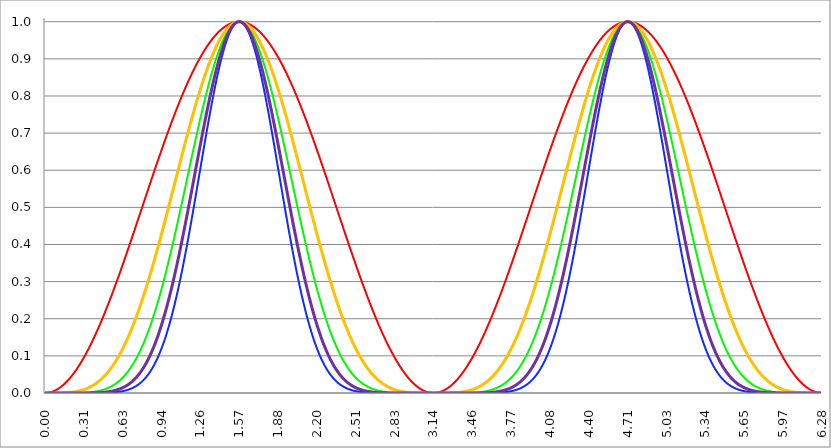
| Category | Series 1 | Series 0 | Series 2 | Series 3 | Series 4 |
|---|---|---|---|---|---|
| 0.0 | 0 | 0 | 0 | 0 | 0 |
| 0.00314159265358979 | 0 | 0 | 0 | 0 | 0 |
| 0.00628318530717958 | 0 | 0 | 0 | 0 | 0 |
| 0.00942477796076938 | 0 | 0 | 0 | 0 | 0 |
| 0.0125663706143592 | 0 | 0 | 0 | 0 | 0 |
| 0.015707963267949 | 0 | 0 | 0 | 0 | 0 |
| 0.0188495559215388 | 0 | 0 | 0 | 0 | 0 |
| 0.0219911485751285 | 0 | 0 | 0 | 0 | 0 |
| 0.0251327412287183 | 0.001 | 0 | 0 | 0 | 0 |
| 0.0282743338823081 | 0.001 | 0 | 0 | 0 | 0 |
| 0.0314159265358979 | 0.001 | 0 | 0 | 0 | 0 |
| 0.0345575191894877 | 0.001 | 0 | 0 | 0 | 0 |
| 0.0376991118430775 | 0.001 | 0 | 0 | 0 | 0 |
| 0.0408407044966673 | 0.002 | 0 | 0 | 0 | 0 |
| 0.0439822971502571 | 0.002 | 0 | 0 | 0 | 0 |
| 0.0471238898038469 | 0.002 | 0 | 0 | 0 | 0 |
| 0.0502654824574367 | 0.003 | 0 | 0 | 0 | 0 |
| 0.0534070751110265 | 0.003 | 0 | 0 | 0 | 0 |
| 0.0565486677646163 | 0.003 | 0 | 0 | 0 | 0 |
| 0.059690260418206 | 0.004 | 0 | 0 | 0 | 0 |
| 0.0628318530717958 | 0.004 | 0 | 0 | 0 | 0 |
| 0.0659734457253856 | 0.004 | 0 | 0 | 0 | 0 |
| 0.0691150383789754 | 0.005 | 0 | 0 | 0 | 0 |
| 0.0722566310325652 | 0.005 | 0 | 0 | 0 | 0 |
| 0.075398223686155 | 0.006 | 0 | 0 | 0 | 0 |
| 0.0785398163397448 | 0.006 | 0 | 0 | 0 | 0 |
| 0.0816814089933346 | 0.007 | 0 | 0 | 0 | 0 |
| 0.0848230016469244 | 0.007 | 0 | 0 | 0 | 0 |
| 0.0879645943005142 | 0.008 | 0 | 0 | 0 | 0 |
| 0.091106186954104 | 0.008 | 0 | 0 | 0 | 0 |
| 0.0942477796076937 | 0.009 | 0 | 0 | 0 | 0 |
| 0.0973893722612835 | 0.009 | 0 | 0 | 0 | 0 |
| 0.100530964914873 | 0.01 | 0 | 0 | 0 | 0 |
| 0.103672557568463 | 0.011 | 0 | 0 | 0 | 0 |
| 0.106814150222053 | 0.011 | 0 | 0 | 0 | 0 |
| 0.109955742875643 | 0.012 | 0 | 0 | 0 | 0 |
| 0.113097335529233 | 0.013 | 0 | 0 | 0 | 0 |
| 0.116238928182822 | 0.013 | 0 | 0 | 0 | 0 |
| 0.119380520836412 | 0.014 | 0 | 0 | 0 | 0 |
| 0.122522113490002 | 0.015 | 0 | 0 | 0 | 0 |
| 0.125663706143592 | 0.016 | 0 | 0 | 0 | 0 |
| 0.128805298797181 | 0.016 | 0 | 0 | 0 | 0 |
| 0.131946891450771 | 0.017 | 0 | 0 | 0 | 0 |
| 0.135088484104361 | 0.018 | 0 | 0 | 0 | 0 |
| 0.138230076757951 | 0.019 | 0 | 0 | 0 | 0 |
| 0.141371669411541 | 0.02 | 0 | 0 | 0 | 0 |
| 0.14451326206513 | 0.021 | 0 | 0 | 0 | 0 |
| 0.14765485471872 | 0.022 | 0 | 0 | 0 | 0 |
| 0.15079644737231 | 0.023 | 0 | 0 | 0.001 | 0 |
| 0.1539380400259 | 0.024 | 0 | 0 | 0.001 | 0 |
| 0.15707963267949 | 0.024 | 0 | 0 | 0.001 | 0 |
| 0.160221225333079 | 0.025 | 0 | 0 | 0.001 | 0 |
| 0.163362817986669 | 0.026 | 0 | 0 | 0.001 | 0 |
| 0.166504410640259 | 0.027 | 0 | 0 | 0.001 | 0 |
| 0.169646003293849 | 0.029 | 0 | 0 | 0.001 | 0 |
| 0.172787595947439 | 0.03 | 0 | 0 | 0.001 | 0 |
| 0.175929188601028 | 0.031 | 0 | 0 | 0.001 | 0 |
| 0.179070781254618 | 0.032 | 0 | 0 | 0.001 | 0 |
| 0.182212373908208 | 0.033 | 0 | 0 | 0.001 | 0 |
| 0.185353966561798 | 0.034 | 0 | 0 | 0.001 | 0 |
| 0.188495559215388 | 0.035 | 0 | 0 | 0.001 | 0 |
| 0.191637151868977 | 0.036 | 0 | 0 | 0.001 | 0 |
| 0.194778744522567 | 0.037 | 0 | 0 | 0.001 | 0 |
| 0.197920337176157 | 0.039 | 0 | 0 | 0.001 | 0 |
| 0.201061929829747 | 0.04 | 0 | 0 | 0.002 | 0 |
| 0.204203522483336 | 0.041 | 0 | 0 | 0.002 | 0 |
| 0.207345115136926 | 0.042 | 0 | 0 | 0.002 | 0 |
| 0.210486707790516 | 0.044 | 0 | 0 | 0.002 | 0 |
| 0.213628300444106 | 0.045 | 0 | 0 | 0.002 | 0 |
| 0.216769893097696 | 0.046 | 0 | 0 | 0.002 | 0 |
| 0.219911485751285 | 0.048 | 0 | 0 | 0.002 | 0 |
| 0.223053078404875 | 0.049 | 0 | 0 | 0.002 | 0 |
| 0.226194671058465 | 0.05 | 0 | 0 | 0.003 | 0 |
| 0.229336263712055 | 0.052 | 0 | 0 | 0.003 | 0 |
| 0.232477856365645 | 0.053 | 0 | 0 | 0.003 | 0 |
| 0.235619449019234 | 0.054 | 0 | 0 | 0.003 | 0 |
| 0.238761041672824 | 0.056 | 0 | 0 | 0.003 | 0 |
| 0.241902634326414 | 0.057 | 0 | 0 | 0.003 | 0 |
| 0.245044226980004 | 0.059 | 0 | 0 | 0.003 | 0 |
| 0.248185819633594 | 0.06 | 0 | 0 | 0.004 | 0 |
| 0.251327412287183 | 0.062 | 0 | 0 | 0.004 | 0 |
| 0.254469004940773 | 0.063 | 0 | 0 | 0.004 | 0 |
| 0.257610597594363 | 0.065 | 0 | 0 | 0.004 | 0 |
| 0.260752190247953 | 0.066 | 0 | 0 | 0.004 | 0 |
| 0.263893782901543 | 0.068 | 0 | 0 | 0.005 | 0 |
| 0.267035375555132 | 0.07 | 0 | 0 | 0.005 | 0 |
| 0.270176968208722 | 0.071 | 0 | 0 | 0.005 | 0 |
| 0.273318560862312 | 0.073 | 0 | 0 | 0.005 | 0 |
| 0.276460153515902 | 0.075 | 0 | 0 | 0.006 | 0 |
| 0.279601746169492 | 0.076 | 0 | 0 | 0.006 | 0 |
| 0.282743338823082 | 0.078 | 0 | 0 | 0.006 | 0 |
| 0.285884931476671 | 0.08 | 0.001 | 0 | 0.006 | 0 |
| 0.289026524130261 | 0.081 | 0.001 | 0 | 0.007 | 0 |
| 0.292168116783851 | 0.083 | 0.001 | 0 | 0.007 | 0 |
| 0.295309709437441 | 0.085 | 0.001 | 0 | 0.007 | 0 |
| 0.298451302091031 | 0.086 | 0.001 | 0 | 0.007 | 0 |
| 0.30159289474462 | 0.088 | 0.001 | 0 | 0.008 | 0 |
| 0.30473448739821 | 0.09 | 0.001 | 0 | 0.008 | 0 |
| 0.3078760800518 | 0.092 | 0.001 | 0 | 0.008 | 0 |
| 0.31101767270539 | 0.094 | 0.001 | 0 | 0.009 | 0 |
| 0.31415926535898 | 0.095 | 0.001 | 0 | 0.009 | 0 |
| 0.31730085801257 | 0.097 | 0.001 | 0 | 0.009 | 0 |
| 0.320442450666159 | 0.099 | 0.001 | 0 | 0.01 | 0 |
| 0.323584043319749 | 0.101 | 0.001 | 0 | 0.01 | 0 |
| 0.326725635973339 | 0.103 | 0.001 | 0 | 0.011 | 0 |
| 0.329867228626929 | 0.105 | 0.001 | 0 | 0.011 | 0 |
| 0.333008821280519 | 0.107 | 0.001 | 0 | 0.011 | 0 |
| 0.336150413934108 | 0.109 | 0.001 | 0 | 0.012 | 0 |
| 0.339292006587698 | 0.111 | 0.001 | 0 | 0.012 | 0 |
| 0.342433599241288 | 0.113 | 0.001 | 0 | 0.013 | 0 |
| 0.345575191894878 | 0.115 | 0.002 | 0 | 0.013 | 0 |
| 0.348716784548468 | 0.117 | 0.002 | 0 | 0.014 | 0 |
| 0.351858377202058 | 0.119 | 0.002 | 0 | 0.014 | 0 |
| 0.354999969855647 | 0.121 | 0.002 | 0 | 0.015 | 0 |
| 0.358141562509237 | 0.123 | 0.002 | 0 | 0.015 | 0 |
| 0.361283155162827 | 0.125 | 0.002 | 0 | 0.016 | 0 |
| 0.364424747816417 | 0.127 | 0.002 | 0 | 0.016 | 0 |
| 0.367566340470007 | 0.129 | 0.002 | 0 | 0.017 | 0 |
| 0.370707933123597 | 0.131 | 0.002 | 0 | 0.017 | 0 |
| 0.373849525777186 | 0.133 | 0.002 | 0 | 0.018 | 0 |
| 0.376991118430776 | 0.136 | 0.002 | 0 | 0.018 | 0 |
| 0.380132711084366 | 0.138 | 0.003 | 0 | 0.019 | 0 |
| 0.383274303737956 | 0.14 | 0.003 | 0 | 0.02 | 0 |
| 0.386415896391546 | 0.142 | 0.003 | 0 | 0.02 | 0 |
| 0.389557489045135 | 0.144 | 0.003 | 0 | 0.021 | 0 |
| 0.392699081698725 | 0.146 | 0.003 | 0 | 0.021 | 0 |
| 0.395840674352315 | 0.149 | 0.003 | 0 | 0.022 | 0 |
| 0.398982267005905 | 0.151 | 0.003 | 0 | 0.023 | 0.001 |
| 0.402123859659495 | 0.153 | 0.004 | 0 | 0.023 | 0.001 |
| 0.405265452313085 | 0.155 | 0.004 | 0 | 0.024 | 0.001 |
| 0.408407044966674 | 0.158 | 0.004 | 0 | 0.025 | 0.001 |
| 0.411548637620264 | 0.16 | 0.004 | 0 | 0.026 | 0.001 |
| 0.414690230273854 | 0.162 | 0.004 | 0 | 0.026 | 0.001 |
| 0.417831822927444 | 0.165 | 0.004 | 0 | 0.027 | 0.001 |
| 0.420973415581034 | 0.167 | 0.005 | 0 | 0.028 | 0.001 |
| 0.424115008234623 | 0.169 | 0.005 | 0 | 0.029 | 0.001 |
| 0.427256600888213 | 0.172 | 0.005 | 0 | 0.029 | 0.001 |
| 0.430398193541803 | 0.174 | 0.005 | 0 | 0.03 | 0.001 |
| 0.433539786195393 | 0.176 | 0.005 | 0 | 0.031 | 0.001 |
| 0.436681378848983 | 0.179 | 0.006 | 0 | 0.032 | 0.001 |
| 0.439822971502573 | 0.181 | 0.006 | 0 | 0.033 | 0.001 |
| 0.442964564156162 | 0.184 | 0.006 | 0 | 0.034 | 0.001 |
| 0.446106156809752 | 0.186 | 0.006 | 0 | 0.035 | 0.001 |
| 0.449247749463342 | 0.189 | 0.007 | 0 | 0.036 | 0.001 |
| 0.452389342116932 | 0.191 | 0.007 | 0 | 0.037 | 0.001 |
| 0.455530934770522 | 0.194 | 0.007 | 0 | 0.037 | 0.001 |
| 0.458672527424111 | 0.196 | 0.008 | 0 | 0.038 | 0.001 |
| 0.461814120077701 | 0.199 | 0.008 | 0 | 0.039 | 0.002 |
| 0.464955712731291 | 0.201 | 0.008 | 0 | 0.04 | 0.002 |
| 0.468097305384881 | 0.204 | 0.008 | 0 | 0.041 | 0.002 |
| 0.471238898038471 | 0.206 | 0.009 | 0 | 0.042 | 0.002 |
| 0.474380490692061 | 0.209 | 0.009 | 0 | 0.044 | 0.002 |
| 0.47752208334565 | 0.211 | 0.009 | 0 | 0.045 | 0.002 |
| 0.48066367599924 | 0.214 | 0.01 | 0 | 0.046 | 0.002 |
| 0.48380526865283 | 0.216 | 0.01 | 0 | 0.047 | 0.002 |
| 0.48694686130642 | 0.219 | 0.01 | 0.001 | 0.048 | 0.002 |
| 0.49008845396001 | 0.222 | 0.011 | 0.001 | 0.049 | 0.002 |
| 0.493230046613599 | 0.224 | 0.011 | 0.001 | 0.05 | 0.003 |
| 0.496371639267189 | 0.227 | 0.012 | 0.001 | 0.051 | 0.003 |
| 0.499513231920779 | 0.229 | 0.012 | 0.001 | 0.053 | 0.003 |
| 0.502654824574369 | 0.232 | 0.013 | 0.001 | 0.054 | 0.003 |
| 0.505796417227959 | 0.235 | 0.013 | 0.001 | 0.055 | 0.003 |
| 0.508938009881549 | 0.237 | 0.013 | 0.001 | 0.056 | 0.003 |
| 0.512079602535138 | 0.24 | 0.014 | 0.001 | 0.058 | 0.003 |
| 0.515221195188728 | 0.243 | 0.014 | 0.001 | 0.059 | 0.003 |
| 0.518362787842318 | 0.245 | 0.015 | 0.001 | 0.06 | 0.004 |
| 0.521504380495908 | 0.248 | 0.015 | 0.001 | 0.062 | 0.004 |
| 0.524645973149498 | 0.251 | 0.016 | 0.001 | 0.063 | 0.004 |
| 0.527787565803087 | 0.254 | 0.016 | 0.001 | 0.064 | 0.004 |
| 0.530929158456677 | 0.256 | 0.017 | 0.001 | 0.066 | 0.004 |
| 0.534070751110267 | 0.259 | 0.017 | 0.001 | 0.067 | 0.005 |
| 0.537212343763857 | 0.262 | 0.018 | 0.001 | 0.069 | 0.005 |
| 0.540353936417447 | 0.265 | 0.019 | 0.001 | 0.07 | 0.005 |
| 0.543495529071037 | 0.267 | 0.019 | 0.001 | 0.072 | 0.005 |
| 0.546637121724626 | 0.27 | 0.02 | 0.001 | 0.073 | 0.005 |
| 0.549778714378216 | 0.273 | 0.02 | 0.002 | 0.075 | 0.006 |
| 0.552920307031806 | 0.276 | 0.021 | 0.002 | 0.076 | 0.006 |
| 0.556061899685396 | 0.279 | 0.022 | 0.002 | 0.078 | 0.006 |
| 0.559203492338986 | 0.281 | 0.022 | 0.002 | 0.079 | 0.006 |
| 0.562345084992576 | 0.284 | 0.023 | 0.002 | 0.081 | 0.007 |
| 0.565486677646165 | 0.287 | 0.024 | 0.002 | 0.082 | 0.007 |
| 0.568628270299755 | 0.29 | 0.024 | 0.002 | 0.084 | 0.007 |
| 0.571769862953345 | 0.293 | 0.025 | 0.002 | 0.086 | 0.007 |
| 0.574911455606935 | 0.296 | 0.026 | 0.002 | 0.087 | 0.008 |
| 0.578053048260525 | 0.299 | 0.027 | 0.002 | 0.089 | 0.008 |
| 0.581194640914114 | 0.301 | 0.027 | 0.002 | 0.091 | 0.008 |
| 0.584336233567704 | 0.304 | 0.028 | 0.003 | 0.093 | 0.009 |
| 0.587477826221294 | 0.307 | 0.029 | 0.003 | 0.094 | 0.009 |
| 0.590619418874884 | 0.31 | 0.03 | 0.003 | 0.096 | 0.009 |
| 0.593761011528474 | 0.313 | 0.031 | 0.003 | 0.098 | 0.01 |
| 0.596902604182064 | 0.316 | 0.032 | 0.003 | 0.1 | 0.01 |
| 0.600044196835653 | 0.319 | 0.032 | 0.003 | 0.102 | 0.01 |
| 0.603185789489243 | 0.322 | 0.033 | 0.003 | 0.104 | 0.011 |
| 0.606327382142833 | 0.325 | 0.034 | 0.004 | 0.105 | 0.011 |
| 0.609468974796423 | 0.328 | 0.035 | 0.004 | 0.107 | 0.012 |
| 0.612610567450013 | 0.331 | 0.036 | 0.004 | 0.109 | 0.012 |
| 0.615752160103602 | 0.334 | 0.037 | 0.004 | 0.111 | 0.012 |
| 0.618893752757192 | 0.337 | 0.038 | 0.004 | 0.113 | 0.013 |
| 0.622035345410782 | 0.34 | 0.039 | 0.005 | 0.115 | 0.013 |
| 0.625176938064372 | 0.343 | 0.04 | 0.005 | 0.117 | 0.014 |
| 0.628318530717962 | 0.345 | 0.041 | 0.005 | 0.119 | 0.014 |
| 0.631460123371551 | 0.348 | 0.042 | 0.005 | 0.121 | 0.015 |
| 0.634601716025141 | 0.351 | 0.043 | 0.005 | 0.124 | 0.015 |
| 0.637743308678731 | 0.354 | 0.045 | 0.006 | 0.126 | 0.016 |
| 0.640884901332321 | 0.357 | 0.046 | 0.006 | 0.128 | 0.016 |
| 0.644026493985911 | 0.361 | 0.047 | 0.006 | 0.13 | 0.017 |
| 0.647168086639501 | 0.364 | 0.048 | 0.006 | 0.132 | 0.017 |
| 0.65030967929309 | 0.367 | 0.049 | 0.007 | 0.134 | 0.018 |
| 0.65345127194668 | 0.37 | 0.05 | 0.007 | 0.137 | 0.019 |
| 0.65659286460027 | 0.373 | 0.052 | 0.007 | 0.139 | 0.019 |
| 0.65973445725386 | 0.376 | 0.053 | 0.007 | 0.141 | 0.02 |
| 0.66287604990745 | 0.379 | 0.054 | 0.008 | 0.143 | 0.021 |
| 0.666017642561039 | 0.382 | 0.056 | 0.008 | 0.146 | 0.021 |
| 0.669159235214629 | 0.385 | 0.057 | 0.008 | 0.148 | 0.022 |
| 0.672300827868219 | 0.388 | 0.058 | 0.009 | 0.15 | 0.023 |
| 0.675442420521809 | 0.391 | 0.06 | 0.009 | 0.153 | 0.023 |
| 0.678584013175399 | 0.394 | 0.061 | 0.009 | 0.155 | 0.024 |
| 0.681725605828989 | 0.397 | 0.063 | 0.01 | 0.158 | 0.025 |
| 0.684867198482578 | 0.4 | 0.064 | 0.01 | 0.16 | 0.026 |
| 0.688008791136168 | 0.403 | 0.066 | 0.011 | 0.163 | 0.026 |
| 0.691150383789758 | 0.406 | 0.067 | 0.011 | 0.165 | 0.027 |
| 0.694291976443348 | 0.409 | 0.069 | 0.012 | 0.168 | 0.028 |
| 0.697433569096938 | 0.412 | 0.07 | 0.012 | 0.17 | 0.029 |
| 0.700575161750528 | 0.416 | 0.072 | 0.012 | 0.173 | 0.03 |
| 0.703716754404117 | 0.419 | 0.073 | 0.013 | 0.175 | 0.031 |
| 0.706858347057707 | 0.422 | 0.075 | 0.013 | 0.178 | 0.032 |
| 0.709999939711297 | 0.425 | 0.077 | 0.014 | 0.181 | 0.033 |
| 0.713141532364887 | 0.428 | 0.078 | 0.014 | 0.183 | 0.034 |
| 0.716283125018477 | 0.431 | 0.08 | 0.015 | 0.186 | 0.035 |
| 0.719424717672066 | 0.434 | 0.082 | 0.015 | 0.189 | 0.036 |
| 0.722566310325656 | 0.437 | 0.084 | 0.016 | 0.191 | 0.037 |
| 0.725707902979246 | 0.44 | 0.085 | 0.017 | 0.194 | 0.038 |
| 0.728849495632836 | 0.444 | 0.087 | 0.017 | 0.197 | 0.039 |
| 0.731991088286426 | 0.447 | 0.089 | 0.018 | 0.2 | 0.04 |
| 0.735132680940016 | 0.45 | 0.091 | 0.018 | 0.202 | 0.041 |
| 0.738274273593605 | 0.453 | 0.093 | 0.019 | 0.205 | 0.042 |
| 0.741415866247195 | 0.456 | 0.095 | 0.02 | 0.208 | 0.043 |
| 0.744557458900785 | 0.459 | 0.097 | 0.02 | 0.211 | 0.044 |
| 0.747699051554375 | 0.462 | 0.099 | 0.021 | 0.214 | 0.046 |
| 0.750840644207965 | 0.465 | 0.101 | 0.022 | 0.217 | 0.047 |
| 0.753982236861554 | 0.469 | 0.103 | 0.023 | 0.22 | 0.048 |
| 0.757123829515144 | 0.472 | 0.105 | 0.023 | 0.223 | 0.05 |
| 0.760265422168734 | 0.475 | 0.107 | 0.024 | 0.226 | 0.051 |
| 0.763407014822324 | 0.478 | 0.109 | 0.025 | 0.228 | 0.052 |
| 0.766548607475914 | 0.481 | 0.111 | 0.026 | 0.232 | 0.054 |
| 0.769690200129504 | 0.484 | 0.114 | 0.027 | 0.235 | 0.055 |
| 0.772831792783093 | 0.487 | 0.116 | 0.028 | 0.238 | 0.056 |
| 0.775973385436683 | 0.491 | 0.118 | 0.028 | 0.241 | 0.058 |
| 0.779114978090273 | 0.494 | 0.12 | 0.029 | 0.244 | 0.059 |
| 0.782256570743863 | 0.497 | 0.123 | 0.03 | 0.247 | 0.061 |
| 0.785398163397453 | 0.5 | 0.125 | 0.031 | 0.25 | 0.063 |
| 0.788539756051042 | 0.503 | 0.127 | 0.032 | 0.253 | 0.064 |
| 0.791681348704632 | 0.506 | 0.13 | 0.033 | 0.256 | 0.066 |
| 0.794822941358222 | 0.509 | 0.132 | 0.034 | 0.26 | 0.067 |
| 0.797964534011812 | 0.513 | 0.135 | 0.035 | 0.263 | 0.069 |
| 0.801106126665402 | 0.516 | 0.137 | 0.036 | 0.266 | 0.071 |
| 0.804247719318992 | 0.519 | 0.14 | 0.038 | 0.269 | 0.072 |
| 0.807389311972581 | 0.522 | 0.142 | 0.039 | 0.272 | 0.074 |
| 0.810530904626171 | 0.525 | 0.145 | 0.04 | 0.276 | 0.076 |
| 0.813672497279761 | 0.528 | 0.147 | 0.041 | 0.279 | 0.078 |
| 0.816814089933351 | 0.531 | 0.15 | 0.042 | 0.282 | 0.08 |
| 0.819955682586941 | 0.535 | 0.153 | 0.044 | 0.286 | 0.082 |
| 0.823097275240531 | 0.538 | 0.155 | 0.045 | 0.289 | 0.084 |
| 0.82623886789412 | 0.541 | 0.158 | 0.046 | 0.292 | 0.086 |
| 0.82938046054771 | 0.544 | 0.161 | 0.048 | 0.296 | 0.088 |
| 0.8325220532013 | 0.547 | 0.164 | 0.049 | 0.299 | 0.09 |
| 0.83566364585489 | 0.55 | 0.167 | 0.05 | 0.303 | 0.092 |
| 0.83880523850848 | 0.553 | 0.169 | 0.052 | 0.306 | 0.094 |
| 0.841946831162069 | 0.556 | 0.172 | 0.053 | 0.31 | 0.096 |
| 0.845088423815659 | 0.56 | 0.175 | 0.055 | 0.313 | 0.098 |
| 0.848230016469249 | 0.563 | 0.178 | 0.056 | 0.317 | 0.1 |
| 0.851371609122839 | 0.566 | 0.181 | 0.058 | 0.32 | 0.102 |
| 0.854513201776429 | 0.569 | 0.184 | 0.06 | 0.324 | 0.105 |
| 0.857654794430019 | 0.572 | 0.187 | 0.061 | 0.327 | 0.107 |
| 0.860796387083608 | 0.575 | 0.19 | 0.063 | 0.331 | 0.109 |
| 0.863937979737198 | 0.578 | 0.193 | 0.065 | 0.334 | 0.112 |
| 0.867079572390788 | 0.581 | 0.196 | 0.066 | 0.338 | 0.114 |
| 0.870221165044378 | 0.584 | 0.2 | 0.068 | 0.342 | 0.117 |
| 0.873362757697968 | 0.588 | 0.203 | 0.07 | 0.345 | 0.119 |
| 0.876504350351557 | 0.591 | 0.206 | 0.072 | 0.349 | 0.122 |
| 0.879645943005147 | 0.594 | 0.209 | 0.074 | 0.352 | 0.124 |
| 0.882787535658737 | 0.597 | 0.213 | 0.076 | 0.356 | 0.127 |
| 0.885929128312327 | 0.6 | 0.216 | 0.078 | 0.36 | 0.129 |
| 0.889070720965917 | 0.603 | 0.219 | 0.08 | 0.364 | 0.132 |
| 0.892212313619507 | 0.606 | 0.223 | 0.082 | 0.367 | 0.135 |
| 0.895353906273096 | 0.609 | 0.226 | 0.084 | 0.371 | 0.138 |
| 0.898495498926686 | 0.612 | 0.229 | 0.086 | 0.375 | 0.14 |
| 0.901637091580276 | 0.615 | 0.233 | 0.088 | 0.378 | 0.143 |
| 0.904778684233866 | 0.618 | 0.236 | 0.09 | 0.382 | 0.146 |
| 0.907920276887456 | 0.621 | 0.24 | 0.093 | 0.386 | 0.149 |
| 0.911061869541045 | 0.624 | 0.243 | 0.095 | 0.39 | 0.152 |
| 0.914203462194635 | 0.627 | 0.247 | 0.097 | 0.394 | 0.155 |
| 0.917345054848225 | 0.63 | 0.251 | 0.1 | 0.397 | 0.158 |
| 0.920486647501815 | 0.633 | 0.254 | 0.102 | 0.401 | 0.161 |
| 0.923628240155405 | 0.636 | 0.258 | 0.104 | 0.405 | 0.164 |
| 0.926769832808995 | 0.639 | 0.262 | 0.107 | 0.409 | 0.167 |
| 0.929911425462584 | 0.643 | 0.265 | 0.109 | 0.413 | 0.17 |
| 0.933053018116174 | 0.646 | 0.269 | 0.112 | 0.417 | 0.174 |
| 0.936194610769764 | 0.649 | 0.273 | 0.115 | 0.421 | 0.177 |
| 0.939336203423354 | 0.652 | 0.277 | 0.117 | 0.424 | 0.18 |
| 0.942477796076944 | 0.655 | 0.28 | 0.12 | 0.428 | 0.184 |
| 0.945619388730533 | 0.657 | 0.284 | 0.123 | 0.432 | 0.187 |
| 0.948760981384123 | 0.66 | 0.288 | 0.126 | 0.436 | 0.19 |
| 0.951902574037713 | 0.663 | 0.292 | 0.129 | 0.44 | 0.194 |
| 0.955044166691303 | 0.666 | 0.296 | 0.131 | 0.444 | 0.197 |
| 0.958185759344893 | 0.669 | 0.3 | 0.134 | 0.448 | 0.201 |
| 0.961327351998483 | 0.672 | 0.304 | 0.137 | 0.452 | 0.204 |
| 0.964468944652072 | 0.675 | 0.308 | 0.14 | 0.456 | 0.208 |
| 0.967610537305662 | 0.678 | 0.312 | 0.143 | 0.46 | 0.212 |
| 0.970752129959252 | 0.681 | 0.316 | 0.147 | 0.464 | 0.215 |
| 0.973893722612842 | 0.684 | 0.32 | 0.15 | 0.468 | 0.219 |
| 0.977035315266432 | 0.687 | 0.324 | 0.153 | 0.472 | 0.223 |
| 0.980176907920022 | 0.69 | 0.328 | 0.156 | 0.476 | 0.227 |
| 0.983318500573611 | 0.693 | 0.333 | 0.16 | 0.48 | 0.23 |
| 0.986460093227201 | 0.696 | 0.337 | 0.163 | 0.484 | 0.234 |
| 0.989601685880791 | 0.699 | 0.341 | 0.166 | 0.488 | 0.238 |
| 0.992743278534381 | 0.701 | 0.345 | 0.17 | 0.492 | 0.242 |
| 0.995884871187971 | 0.704 | 0.349 | 0.173 | 0.496 | 0.246 |
| 0.99902646384156 | 0.707 | 0.354 | 0.177 | 0.5 | 0.25 |
| 1.00216805649515 | 0.71 | 0.358 | 0.18 | 0.504 | 0.254 |
| 1.00530964914874 | 0.713 | 0.362 | 0.184 | 0.508 | 0.258 |
| 1.00845124180233 | 0.716 | 0.367 | 0.188 | 0.512 | 0.262 |
| 1.01159283445592 | 0.719 | 0.371 | 0.192 | 0.516 | 0.267 |
| 1.01473442710951 | 0.721 | 0.375 | 0.195 | 0.52 | 0.271 |
| 1.017876019763099 | 0.724 | 0.38 | 0.199 | 0.524 | 0.275 |
| 1.021017612416689 | 0.727 | 0.384 | 0.203 | 0.529 | 0.279 |
| 1.02415920507028 | 0.73 | 0.389 | 0.207 | 0.533 | 0.284 |
| 1.027300797723869 | 0.733 | 0.393 | 0.211 | 0.537 | 0.288 |
| 1.030442390377459 | 0.735 | 0.398 | 0.215 | 0.541 | 0.292 |
| 1.033583983031048 | 0.738 | 0.402 | 0.219 | 0.545 | 0.297 |
| 1.036725575684638 | 0.741 | 0.407 | 0.223 | 0.549 | 0.301 |
| 1.039867168338228 | 0.744 | 0.411 | 0.227 | 0.553 | 0.306 |
| 1.043008760991818 | 0.746 | 0.416 | 0.232 | 0.557 | 0.31 |
| 1.046150353645408 | 0.749 | 0.42 | 0.236 | 0.561 | 0.315 |
| 1.049291946298998 | 0.752 | 0.425 | 0.24 | 0.565 | 0.319 |
| 1.052433538952587 | 0.755 | 0.43 | 0.245 | 0.569 | 0.324 |
| 1.055575131606177 | 0.757 | 0.434 | 0.249 | 0.573 | 0.329 |
| 1.058716724259767 | 0.76 | 0.439 | 0.253 | 0.577 | 0.333 |
| 1.061858316913357 | 0.763 | 0.443 | 0.258 | 0.582 | 0.338 |
| 1.064999909566947 | 0.765 | 0.448 | 0.262 | 0.586 | 0.343 |
| 1.068141502220536 | 0.768 | 0.453 | 0.267 | 0.59 | 0.348 |
| 1.071283094874126 | 0.771 | 0.458 | 0.272 | 0.594 | 0.353 |
| 1.074424687527716 | 0.773 | 0.462 | 0.276 | 0.598 | 0.357 |
| 1.077566280181306 | 0.776 | 0.467 | 0.281 | 0.602 | 0.362 |
| 1.080707872834896 | 0.778 | 0.472 | 0.286 | 0.606 | 0.367 |
| 1.083849465488486 | 0.781 | 0.476 | 0.291 | 0.61 | 0.372 |
| 1.086991058142075 | 0.784 | 0.481 | 0.296 | 0.614 | 0.377 |
| 1.090132650795665 | 0.786 | 0.486 | 0.3 | 0.618 | 0.382 |
| 1.093274243449255 | 0.789 | 0.491 | 0.305 | 0.622 | 0.387 |
| 1.096415836102845 | 0.791 | 0.496 | 0.31 | 0.626 | 0.392 |
| 1.099557428756435 | 0.794 | 0.5 | 0.315 | 0.63 | 0.397 |
| 1.102699021410025 | 0.796 | 0.505 | 0.32 | 0.634 | 0.402 |
| 1.105840614063614 | 0.799 | 0.51 | 0.326 | 0.638 | 0.407 |
| 1.108982206717204 | 0.801 | 0.515 | 0.331 | 0.642 | 0.413 |
| 1.112123799370794 | 0.804 | 0.52 | 0.336 | 0.646 | 0.418 |
| 1.115265392024384 | 0.806 | 0.524 | 0.341 | 0.65 | 0.423 |
| 1.118406984677974 | 0.809 | 0.529 | 0.346 | 0.654 | 0.428 |
| 1.121548577331563 | 0.811 | 0.534 | 0.352 | 0.658 | 0.433 |
| 1.124690169985153 | 0.814 | 0.539 | 0.357 | 0.662 | 0.439 |
| 1.127831762638743 | 0.816 | 0.544 | 0.362 | 0.666 | 0.444 |
| 1.130973355292333 | 0.819 | 0.549 | 0.368 | 0.67 | 0.449 |
| 1.134114947945923 | 0.821 | 0.554 | 0.373 | 0.674 | 0.455 |
| 1.137256540599513 | 0.824 | 0.559 | 0.379 | 0.678 | 0.46 |
| 1.140398133253102 | 0.826 | 0.563 | 0.384 | 0.682 | 0.465 |
| 1.143539725906692 | 0.828 | 0.568 | 0.39 | 0.686 | 0.471 |
| 1.146681318560282 | 0.831 | 0.573 | 0.395 | 0.69 | 0.476 |
| 1.149822911213872 | 0.833 | 0.578 | 0.401 | 0.694 | 0.481 |
| 1.152964503867462 | 0.835 | 0.583 | 0.407 | 0.698 | 0.487 |
| 1.156106096521051 | 0.838 | 0.588 | 0.412 | 0.702 | 0.492 |
| 1.159247689174641 | 0.84 | 0.593 | 0.418 | 0.706 | 0.498 |
| 1.162389281828231 | 0.842 | 0.598 | 0.424 | 0.709 | 0.503 |
| 1.165530874481821 | 0.845 | 0.602 | 0.43 | 0.713 | 0.509 |
| 1.168672467135411 | 0.847 | 0.607 | 0.435 | 0.717 | 0.514 |
| 1.171814059789001 | 0.849 | 0.612 | 0.441 | 0.721 | 0.52 |
| 1.17495565244259 | 0.851 | 0.617 | 0.447 | 0.725 | 0.525 |
| 1.17809724509618 | 0.854 | 0.622 | 0.453 | 0.729 | 0.531 |
| 1.18123883774977 | 0.856 | 0.627 | 0.459 | 0.732 | 0.536 |
| 1.18438043040336 | 0.858 | 0.632 | 0.465 | 0.736 | 0.542 |
| 1.18752202305695 | 0.86 | 0.636 | 0.471 | 0.74 | 0.547 |
| 1.190663615710539 | 0.862 | 0.641 | 0.477 | 0.744 | 0.553 |
| 1.193805208364129 | 0.864 | 0.646 | 0.483 | 0.747 | 0.559 |
| 1.19694680101772 | 0.867 | 0.651 | 0.489 | 0.751 | 0.564 |
| 1.200088393671309 | 0.869 | 0.656 | 0.495 | 0.755 | 0.57 |
| 1.203229986324899 | 0.871 | 0.66 | 0.501 | 0.758 | 0.575 |
| 1.206371578978489 | 0.873 | 0.665 | 0.507 | 0.762 | 0.581 |
| 1.209513171632078 | 0.875 | 0.67 | 0.513 | 0.766 | 0.586 |
| 1.212654764285668 | 0.877 | 0.675 | 0.519 | 0.769 | 0.592 |
| 1.215796356939258 | 0.879 | 0.68 | 0.525 | 0.773 | 0.597 |
| 1.218937949592848 | 0.881 | 0.684 | 0.531 | 0.777 | 0.603 |
| 1.222079542246438 | 0.883 | 0.689 | 0.538 | 0.78 | 0.609 |
| 1.225221134900027 | 0.885 | 0.694 | 0.544 | 0.784 | 0.614 |
| 1.228362727553617 | 0.887 | 0.698 | 0.55 | 0.787 | 0.62 |
| 1.231504320207207 | 0.889 | 0.703 | 0.556 | 0.791 | 0.625 |
| 1.234645912860797 | 0.891 | 0.708 | 0.562 | 0.794 | 0.631 |
| 1.237787505514387 | 0.893 | 0.712 | 0.568 | 0.798 | 0.636 |
| 1.240929098167977 | 0.895 | 0.717 | 0.575 | 0.801 | 0.642 |
| 1.244070690821566 | 0.897 | 0.722 | 0.581 | 0.805 | 0.647 |
| 1.247212283475156 | 0.899 | 0.726 | 0.587 | 0.808 | 0.653 |
| 1.250353876128746 | 0.901 | 0.731 | 0.593 | 0.811 | 0.658 |
| 1.253495468782336 | 0.903 | 0.735 | 0.599 | 0.815 | 0.664 |
| 1.256637061435926 | 0.905 | 0.74 | 0.605 | 0.818 | 0.669 |
| 1.259778654089515 | 0.906 | 0.745 | 0.612 | 0.821 | 0.675 |
| 1.262920246743105 | 0.908 | 0.749 | 0.618 | 0.825 | 0.68 |
| 1.266061839396695 | 0.91 | 0.754 | 0.624 | 0.828 | 0.686 |
| 1.269203432050285 | 0.912 | 0.758 | 0.63 | 0.831 | 0.691 |
| 1.272345024703875 | 0.914 | 0.762 | 0.636 | 0.835 | 0.696 |
| 1.275486617357465 | 0.915 | 0.767 | 0.642 | 0.838 | 0.702 |
| 1.278628210011054 | 0.917 | 0.771 | 0.649 | 0.841 | 0.707 |
| 1.281769802664644 | 0.919 | 0.776 | 0.655 | 0.844 | 0.713 |
| 1.284911395318234 | 0.92 | 0.78 | 0.661 | 0.847 | 0.718 |
| 1.288052987971824 | 0.922 | 0.784 | 0.667 | 0.85 | 0.723 |
| 1.291194580625414 | 0.924 | 0.788 | 0.673 | 0.853 | 0.728 |
| 1.294336173279003 | 0.925 | 0.793 | 0.679 | 0.857 | 0.734 |
| 1.297477765932593 | 0.927 | 0.797 | 0.685 | 0.86 | 0.739 |
| 1.300619358586183 | 0.929 | 0.801 | 0.691 | 0.863 | 0.744 |
| 1.303760951239773 | 0.93 | 0.805 | 0.697 | 0.866 | 0.749 |
| 1.306902543893363 | 0.932 | 0.809 | 0.703 | 0.869 | 0.754 |
| 1.310044136546953 | 0.934 | 0.814 | 0.709 | 0.871 | 0.759 |
| 1.313185729200542 | 0.935 | 0.818 | 0.715 | 0.874 | 0.765 |
| 1.316327321854132 | 0.937 | 0.822 | 0.721 | 0.877 | 0.77 |
| 1.319468914507722 | 0.938 | 0.826 | 0.727 | 0.88 | 0.775 |
| 1.322610507161312 | 0.94 | 0.83 | 0.733 | 0.883 | 0.78 |
| 1.325752099814902 | 0.941 | 0.834 | 0.738 | 0.886 | 0.785 |
| 1.328893692468491 | 0.943 | 0.838 | 0.744 | 0.889 | 0.789 |
| 1.332035285122081 | 0.944 | 0.841 | 0.75 | 0.891 | 0.794 |
| 1.335176877775671 | 0.946 | 0.845 | 0.756 | 0.894 | 0.799 |
| 1.338318470429261 | 0.947 | 0.849 | 0.761 | 0.897 | 0.804 |
| 1.341460063082851 | 0.948 | 0.853 | 0.767 | 0.899 | 0.809 |
| 1.344601655736441 | 0.95 | 0.857 | 0.773 | 0.902 | 0.813 |
| 1.34774324839003 | 0.951 | 0.86 | 0.778 | 0.905 | 0.818 |
| 1.35088484104362 | 0.952 | 0.864 | 0.784 | 0.907 | 0.823 |
| 1.35402643369721 | 0.954 | 0.868 | 0.789 | 0.91 | 0.827 |
| 1.3571680263508 | 0.955 | 0.871 | 0.795 | 0.912 | 0.832 |
| 1.36030961900439 | 0.956 | 0.875 | 0.8 | 0.915 | 0.836 |
| 1.363451211657979 | 0.958 | 0.878 | 0.805 | 0.917 | 0.841 |
| 1.36659280431157 | 0.959 | 0.882 | 0.811 | 0.919 | 0.845 |
| 1.369734396965159 | 0.96 | 0.885 | 0.816 | 0.922 | 0.85 |
| 1.372875989618749 | 0.961 | 0.888 | 0.821 | 0.924 | 0.854 |
| 1.376017582272339 | 0.963 | 0.892 | 0.826 | 0.926 | 0.858 |
| 1.379159174925929 | 0.964 | 0.895 | 0.831 | 0.929 | 0.863 |
| 1.382300767579518 | 0.965 | 0.898 | 0.836 | 0.931 | 0.867 |
| 1.385442360233108 | 0.966 | 0.902 | 0.841 | 0.933 | 0.871 |
| 1.388583952886698 | 0.967 | 0.905 | 0.846 | 0.935 | 0.875 |
| 1.391725545540288 | 0.968 | 0.908 | 0.851 | 0.938 | 0.879 |
| 1.394867138193878 | 0.969 | 0.911 | 0.856 | 0.94 | 0.883 |
| 1.398008730847468 | 0.97 | 0.914 | 0.861 | 0.942 | 0.887 |
| 1.401150323501057 | 0.971 | 0.917 | 0.865 | 0.944 | 0.891 |
| 1.404291916154647 | 0.973 | 0.92 | 0.87 | 0.946 | 0.895 |
| 1.407433508808237 | 0.974 | 0.923 | 0.875 | 0.948 | 0.898 |
| 1.410575101461827 | 0.975 | 0.926 | 0.879 | 0.95 | 0.902 |
| 1.413716694115417 | 0.976 | 0.928 | 0.883 | 0.952 | 0.906 |
| 1.416858286769006 | 0.976 | 0.931 | 0.888 | 0.954 | 0.909 |
| 1.419999879422596 | 0.977 | 0.934 | 0.892 | 0.955 | 0.913 |
| 1.423141472076186 | 0.978 | 0.936 | 0.896 | 0.957 | 0.916 |
| 1.426283064729776 | 0.979 | 0.939 | 0.901 | 0.959 | 0.92 |
| 1.429424657383366 | 0.98 | 0.942 | 0.905 | 0.961 | 0.923 |
| 1.432566250036956 | 0.981 | 0.944 | 0.909 | 0.962 | 0.926 |
| 1.435707842690545 | 0.982 | 0.947 | 0.913 | 0.964 | 0.929 |
| 1.438849435344135 | 0.983 | 0.949 | 0.916 | 0.966 | 0.933 |
| 1.441991027997725 | 0.984 | 0.951 | 0.92 | 0.967 | 0.936 |
| 1.445132620651315 | 0.984 | 0.954 | 0.924 | 0.969 | 0.939 |
| 1.448274213304905 | 0.985 | 0.956 | 0.928 | 0.97 | 0.942 |
| 1.451415805958494 | 0.986 | 0.958 | 0.931 | 0.972 | 0.944 |
| 1.454557398612084 | 0.987 | 0.96 | 0.935 | 0.973 | 0.947 |
| 1.457698991265674 | 0.987 | 0.962 | 0.938 | 0.975 | 0.95 |
| 1.460840583919264 | 0.988 | 0.964 | 0.941 | 0.976 | 0.953 |
| 1.463982176572854 | 0.989 | 0.966 | 0.944 | 0.977 | 0.955 |
| 1.467123769226444 | 0.989 | 0.968 | 0.948 | 0.979 | 0.958 |
| 1.470265361880033 | 0.99 | 0.97 | 0.951 | 0.98 | 0.96 |
| 1.473406954533623 | 0.991 | 0.972 | 0.954 | 0.981 | 0.963 |
| 1.476548547187213 | 0.991 | 0.974 | 0.956 | 0.982 | 0.965 |
| 1.479690139840803 | 0.992 | 0.975 | 0.959 | 0.984 | 0.967 |
| 1.482831732494393 | 0.992 | 0.977 | 0.962 | 0.985 | 0.969 |
| 1.485973325147982 | 0.993 | 0.979 | 0.965 | 0.986 | 0.972 |
| 1.489114917801572 | 0.993 | 0.98 | 0.967 | 0.987 | 0.974 |
| 1.492256510455162 | 0.994 | 0.982 | 0.97 | 0.988 | 0.976 |
| 1.495398103108752 | 0.994 | 0.983 | 0.972 | 0.989 | 0.977 |
| 1.498539695762342 | 0.995 | 0.984 | 0.974 | 0.99 | 0.979 |
| 1.501681288415932 | 0.995 | 0.986 | 0.976 | 0.99 | 0.981 |
| 1.504822881069521 | 0.996 | 0.987 | 0.978 | 0.991 | 0.983 |
| 1.507964473723111 | 0.996 | 0.988 | 0.98 | 0.992 | 0.984 |
| 1.511106066376701 | 0.996 | 0.989 | 0.982 | 0.993 | 0.986 |
| 1.514247659030291 | 0.997 | 0.99 | 0.984 | 0.994 | 0.987 |
| 1.517389251683881 | 0.997 | 0.991 | 0.986 | 0.994 | 0.989 |
| 1.520530844337471 | 0.997 | 0.992 | 0.987 | 0.995 | 0.99 |
| 1.52367243699106 | 0.998 | 0.993 | 0.989 | 0.996 | 0.991 |
| 1.52681402964465 | 0.998 | 0.994 | 0.99 | 0.996 | 0.992 |
| 1.52995562229824 | 0.998 | 0.995 | 0.992 | 0.997 | 0.993 |
| 1.53309721495183 | 0.999 | 0.996 | 0.993 | 0.997 | 0.994 |
| 1.53623880760542 | 0.999 | 0.996 | 0.994 | 0.998 | 0.995 |
| 1.539380400259009 | 0.999 | 0.997 | 0.995 | 0.998 | 0.996 |
| 1.542521992912599 | 0.999 | 0.998 | 0.996 | 0.998 | 0.997 |
| 1.545663585566189 | 0.999 | 0.998 | 0.997 | 0.999 | 0.997 |
| 1.548805178219779 | 1 | 0.999 | 0.998 | 0.999 | 0.998 |
| 1.551946770873369 | 1 | 0.999 | 0.998 | 0.999 | 0.999 |
| 1.555088363526959 | 1 | 0.999 | 0.999 | 1 | 0.999 |
| 1.558229956180548 | 1 | 1 | 0.999 | 1 | 0.999 |
| 1.561371548834138 | 1 | 1 | 1 | 1 | 1 |
| 1.564513141487728 | 1 | 1 | 1 | 1 | 1 |
| 1.567654734141318 | 1 | 1 | 1 | 1 | 1 |
| 1.570796326794908 | 1 | 1 | 1 | 1 | 1 |
| 1.573937919448497 | 1 | 1 | 1 | 1 | 1 |
| 1.577079512102087 | 1 | 1 | 1 | 1 | 1 |
| 1.580221104755677 | 1 | 1 | 1 | 1 | 1 |
| 1.583362697409267 | 1 | 1 | 0.999 | 1 | 0.999 |
| 1.586504290062857 | 1 | 0.999 | 0.999 | 1 | 0.999 |
| 1.589645882716447 | 1 | 0.999 | 0.998 | 0.999 | 0.999 |
| 1.592787475370036 | 1 | 0.999 | 0.998 | 0.999 | 0.998 |
| 1.595929068023626 | 0.999 | 0.998 | 0.997 | 0.999 | 0.997 |
| 1.599070660677216 | 0.999 | 0.998 | 0.996 | 0.998 | 0.997 |
| 1.602212253330806 | 0.999 | 0.997 | 0.995 | 0.998 | 0.996 |
| 1.605353845984396 | 0.999 | 0.996 | 0.994 | 0.998 | 0.995 |
| 1.608495438637985 | 0.999 | 0.996 | 0.993 | 0.997 | 0.994 |
| 1.611637031291575 | 0.998 | 0.995 | 0.992 | 0.997 | 0.993 |
| 1.614778623945165 | 0.998 | 0.994 | 0.99 | 0.996 | 0.992 |
| 1.617920216598755 | 0.998 | 0.993 | 0.989 | 0.996 | 0.991 |
| 1.621061809252345 | 0.997 | 0.992 | 0.987 | 0.995 | 0.99 |
| 1.624203401905935 | 0.997 | 0.991 | 0.986 | 0.994 | 0.989 |
| 1.627344994559524 | 0.997 | 0.99 | 0.984 | 0.994 | 0.987 |
| 1.630486587213114 | 0.996 | 0.989 | 0.982 | 0.993 | 0.986 |
| 1.633628179866704 | 0.996 | 0.988 | 0.98 | 0.992 | 0.984 |
| 1.636769772520294 | 0.996 | 0.987 | 0.978 | 0.991 | 0.983 |
| 1.639911365173884 | 0.995 | 0.986 | 0.976 | 0.99 | 0.981 |
| 1.643052957827473 | 0.995 | 0.984 | 0.974 | 0.99 | 0.979 |
| 1.646194550481063 | 0.994 | 0.983 | 0.972 | 0.989 | 0.977 |
| 1.649336143134653 | 0.994 | 0.982 | 0.97 | 0.988 | 0.976 |
| 1.652477735788243 | 0.993 | 0.98 | 0.967 | 0.987 | 0.974 |
| 1.655619328441833 | 0.993 | 0.979 | 0.965 | 0.986 | 0.972 |
| 1.658760921095423 | 0.992 | 0.977 | 0.962 | 0.985 | 0.969 |
| 1.661902513749012 | 0.992 | 0.975 | 0.959 | 0.984 | 0.967 |
| 1.665044106402602 | 0.991 | 0.974 | 0.956 | 0.982 | 0.965 |
| 1.668185699056192 | 0.991 | 0.972 | 0.954 | 0.981 | 0.963 |
| 1.671327291709782 | 0.99 | 0.97 | 0.951 | 0.98 | 0.96 |
| 1.674468884363372 | 0.989 | 0.968 | 0.948 | 0.979 | 0.958 |
| 1.677610477016961 | 0.989 | 0.966 | 0.944 | 0.977 | 0.955 |
| 1.680752069670551 | 0.988 | 0.964 | 0.941 | 0.976 | 0.953 |
| 1.683893662324141 | 0.987 | 0.962 | 0.938 | 0.975 | 0.95 |
| 1.687035254977731 | 0.987 | 0.96 | 0.935 | 0.973 | 0.947 |
| 1.690176847631321 | 0.986 | 0.958 | 0.931 | 0.972 | 0.944 |
| 1.693318440284911 | 0.985 | 0.956 | 0.928 | 0.97 | 0.942 |
| 1.6964600329385 | 0.984 | 0.954 | 0.924 | 0.969 | 0.939 |
| 1.69960162559209 | 0.984 | 0.951 | 0.92 | 0.967 | 0.936 |
| 1.70274321824568 | 0.983 | 0.949 | 0.916 | 0.966 | 0.933 |
| 1.70588481089927 | 0.982 | 0.947 | 0.913 | 0.964 | 0.929 |
| 1.70902640355286 | 0.981 | 0.944 | 0.909 | 0.962 | 0.926 |
| 1.712167996206449 | 0.98 | 0.942 | 0.905 | 0.961 | 0.923 |
| 1.715309588860039 | 0.979 | 0.939 | 0.901 | 0.959 | 0.92 |
| 1.71845118151363 | 0.978 | 0.936 | 0.896 | 0.957 | 0.916 |
| 1.721592774167219 | 0.977 | 0.934 | 0.892 | 0.955 | 0.913 |
| 1.724734366820809 | 0.976 | 0.931 | 0.888 | 0.954 | 0.909 |
| 1.727875959474399 | 0.976 | 0.928 | 0.883 | 0.952 | 0.906 |
| 1.731017552127988 | 0.975 | 0.926 | 0.879 | 0.95 | 0.902 |
| 1.734159144781578 | 0.974 | 0.923 | 0.875 | 0.948 | 0.898 |
| 1.737300737435168 | 0.973 | 0.92 | 0.87 | 0.946 | 0.895 |
| 1.740442330088758 | 0.971 | 0.917 | 0.865 | 0.944 | 0.891 |
| 1.743583922742348 | 0.97 | 0.914 | 0.861 | 0.942 | 0.887 |
| 1.746725515395937 | 0.969 | 0.911 | 0.856 | 0.94 | 0.883 |
| 1.749867108049527 | 0.968 | 0.908 | 0.851 | 0.938 | 0.879 |
| 1.753008700703117 | 0.967 | 0.905 | 0.846 | 0.935 | 0.875 |
| 1.756150293356707 | 0.966 | 0.902 | 0.841 | 0.933 | 0.871 |
| 1.759291886010297 | 0.965 | 0.898 | 0.836 | 0.931 | 0.867 |
| 1.762433478663887 | 0.964 | 0.895 | 0.831 | 0.929 | 0.863 |
| 1.765575071317476 | 0.963 | 0.892 | 0.826 | 0.926 | 0.858 |
| 1.768716663971066 | 0.961 | 0.888 | 0.821 | 0.924 | 0.854 |
| 1.771858256624656 | 0.96 | 0.885 | 0.816 | 0.922 | 0.85 |
| 1.774999849278246 | 0.959 | 0.882 | 0.811 | 0.919 | 0.845 |
| 1.778141441931836 | 0.958 | 0.878 | 0.805 | 0.917 | 0.841 |
| 1.781283034585426 | 0.956 | 0.875 | 0.8 | 0.915 | 0.836 |
| 1.784424627239015 | 0.955 | 0.871 | 0.795 | 0.912 | 0.832 |
| 1.787566219892605 | 0.954 | 0.868 | 0.789 | 0.91 | 0.827 |
| 1.790707812546195 | 0.952 | 0.864 | 0.784 | 0.907 | 0.823 |
| 1.793849405199785 | 0.951 | 0.86 | 0.778 | 0.905 | 0.818 |
| 1.796990997853375 | 0.95 | 0.857 | 0.773 | 0.902 | 0.813 |
| 1.800132590506964 | 0.948 | 0.853 | 0.767 | 0.899 | 0.809 |
| 1.803274183160554 | 0.947 | 0.849 | 0.761 | 0.897 | 0.804 |
| 1.806415775814144 | 0.946 | 0.845 | 0.756 | 0.894 | 0.799 |
| 1.809557368467734 | 0.944 | 0.841 | 0.75 | 0.891 | 0.794 |
| 1.812698961121324 | 0.943 | 0.838 | 0.744 | 0.889 | 0.789 |
| 1.815840553774914 | 0.941 | 0.834 | 0.738 | 0.886 | 0.785 |
| 1.818982146428503 | 0.94 | 0.83 | 0.733 | 0.883 | 0.78 |
| 1.822123739082093 | 0.938 | 0.826 | 0.727 | 0.88 | 0.775 |
| 1.825265331735683 | 0.937 | 0.822 | 0.721 | 0.877 | 0.77 |
| 1.828406924389273 | 0.935 | 0.818 | 0.715 | 0.874 | 0.765 |
| 1.831548517042863 | 0.934 | 0.814 | 0.709 | 0.871 | 0.759 |
| 1.834690109696452 | 0.932 | 0.809 | 0.703 | 0.869 | 0.754 |
| 1.837831702350042 | 0.93 | 0.805 | 0.697 | 0.866 | 0.749 |
| 1.840973295003632 | 0.929 | 0.801 | 0.691 | 0.863 | 0.744 |
| 1.844114887657222 | 0.927 | 0.797 | 0.685 | 0.86 | 0.739 |
| 1.847256480310812 | 0.925 | 0.793 | 0.679 | 0.857 | 0.734 |
| 1.850398072964402 | 0.924 | 0.788 | 0.673 | 0.853 | 0.728 |
| 1.853539665617991 | 0.922 | 0.784 | 0.667 | 0.85 | 0.723 |
| 1.856681258271581 | 0.92 | 0.78 | 0.661 | 0.847 | 0.718 |
| 1.859822850925171 | 0.919 | 0.776 | 0.655 | 0.844 | 0.713 |
| 1.862964443578761 | 0.917 | 0.771 | 0.649 | 0.841 | 0.707 |
| 1.866106036232351 | 0.915 | 0.767 | 0.642 | 0.838 | 0.702 |
| 1.86924762888594 | 0.914 | 0.762 | 0.636 | 0.835 | 0.696 |
| 1.87238922153953 | 0.912 | 0.758 | 0.63 | 0.831 | 0.691 |
| 1.87553081419312 | 0.91 | 0.754 | 0.624 | 0.828 | 0.686 |
| 1.87867240684671 | 0.908 | 0.749 | 0.618 | 0.825 | 0.68 |
| 1.8818139995003 | 0.906 | 0.745 | 0.612 | 0.821 | 0.675 |
| 1.88495559215389 | 0.905 | 0.74 | 0.605 | 0.818 | 0.669 |
| 1.888097184807479 | 0.903 | 0.735 | 0.599 | 0.815 | 0.664 |
| 1.891238777461069 | 0.901 | 0.731 | 0.593 | 0.811 | 0.658 |
| 1.89438037011466 | 0.899 | 0.726 | 0.587 | 0.808 | 0.653 |
| 1.897521962768249 | 0.897 | 0.722 | 0.581 | 0.805 | 0.647 |
| 1.900663555421839 | 0.895 | 0.717 | 0.575 | 0.801 | 0.642 |
| 1.903805148075429 | 0.893 | 0.712 | 0.568 | 0.798 | 0.636 |
| 1.906946740729018 | 0.891 | 0.708 | 0.562 | 0.794 | 0.631 |
| 1.910088333382608 | 0.889 | 0.703 | 0.556 | 0.791 | 0.625 |
| 1.913229926036198 | 0.887 | 0.698 | 0.55 | 0.787 | 0.62 |
| 1.916371518689788 | 0.885 | 0.694 | 0.544 | 0.784 | 0.614 |
| 1.919513111343378 | 0.883 | 0.689 | 0.538 | 0.78 | 0.609 |
| 1.922654703996967 | 0.881 | 0.684 | 0.531 | 0.777 | 0.603 |
| 1.925796296650557 | 0.879 | 0.68 | 0.525 | 0.773 | 0.597 |
| 1.928937889304147 | 0.877 | 0.675 | 0.519 | 0.769 | 0.592 |
| 1.932079481957737 | 0.875 | 0.67 | 0.513 | 0.766 | 0.586 |
| 1.935221074611327 | 0.873 | 0.665 | 0.507 | 0.762 | 0.581 |
| 1.938362667264917 | 0.871 | 0.66 | 0.501 | 0.758 | 0.575 |
| 1.941504259918506 | 0.869 | 0.656 | 0.495 | 0.755 | 0.57 |
| 1.944645852572096 | 0.867 | 0.651 | 0.489 | 0.751 | 0.564 |
| 1.947787445225686 | 0.864 | 0.646 | 0.483 | 0.747 | 0.559 |
| 1.950929037879276 | 0.862 | 0.641 | 0.477 | 0.744 | 0.553 |
| 1.954070630532866 | 0.86 | 0.636 | 0.471 | 0.74 | 0.547 |
| 1.957212223186455 | 0.858 | 0.632 | 0.465 | 0.736 | 0.542 |
| 1.960353815840045 | 0.856 | 0.627 | 0.459 | 0.732 | 0.536 |
| 1.963495408493635 | 0.854 | 0.622 | 0.453 | 0.729 | 0.531 |
| 1.966637001147225 | 0.851 | 0.617 | 0.447 | 0.725 | 0.525 |
| 1.969778593800815 | 0.849 | 0.612 | 0.441 | 0.721 | 0.52 |
| 1.972920186454405 | 0.847 | 0.607 | 0.435 | 0.717 | 0.514 |
| 1.976061779107994 | 0.845 | 0.602 | 0.43 | 0.713 | 0.509 |
| 1.979203371761584 | 0.842 | 0.598 | 0.424 | 0.709 | 0.503 |
| 1.982344964415174 | 0.84 | 0.593 | 0.418 | 0.706 | 0.498 |
| 1.985486557068764 | 0.838 | 0.588 | 0.412 | 0.702 | 0.492 |
| 1.988628149722354 | 0.835 | 0.583 | 0.407 | 0.698 | 0.487 |
| 1.991769742375943 | 0.833 | 0.578 | 0.401 | 0.694 | 0.481 |
| 1.994911335029533 | 0.831 | 0.573 | 0.395 | 0.69 | 0.476 |
| 1.998052927683123 | 0.828 | 0.568 | 0.39 | 0.686 | 0.471 |
| 2.001194520336712 | 0.826 | 0.563 | 0.384 | 0.682 | 0.465 |
| 2.004336112990302 | 0.824 | 0.559 | 0.379 | 0.678 | 0.46 |
| 2.007477705643892 | 0.821 | 0.554 | 0.373 | 0.674 | 0.455 |
| 2.010619298297482 | 0.819 | 0.549 | 0.368 | 0.67 | 0.449 |
| 2.013760890951071 | 0.816 | 0.544 | 0.362 | 0.666 | 0.444 |
| 2.016902483604661 | 0.814 | 0.539 | 0.357 | 0.662 | 0.439 |
| 2.02004407625825 | 0.811 | 0.534 | 0.352 | 0.658 | 0.433 |
| 2.02318566891184 | 0.809 | 0.529 | 0.346 | 0.654 | 0.428 |
| 2.02632726156543 | 0.806 | 0.524 | 0.341 | 0.65 | 0.423 |
| 2.029468854219019 | 0.804 | 0.52 | 0.336 | 0.646 | 0.418 |
| 2.032610446872609 | 0.801 | 0.515 | 0.331 | 0.642 | 0.413 |
| 2.035752039526198 | 0.799 | 0.51 | 0.326 | 0.638 | 0.407 |
| 2.038893632179788 | 0.796 | 0.505 | 0.32 | 0.634 | 0.402 |
| 2.042035224833378 | 0.794 | 0.5 | 0.315 | 0.63 | 0.397 |
| 2.045176817486967 | 0.791 | 0.496 | 0.31 | 0.626 | 0.392 |
| 2.048318410140557 | 0.789 | 0.491 | 0.305 | 0.622 | 0.387 |
| 2.051460002794146 | 0.786 | 0.486 | 0.3 | 0.618 | 0.382 |
| 2.054601595447736 | 0.784 | 0.481 | 0.296 | 0.614 | 0.377 |
| 2.057743188101325 | 0.781 | 0.476 | 0.291 | 0.61 | 0.372 |
| 2.060884780754915 | 0.778 | 0.472 | 0.286 | 0.606 | 0.367 |
| 2.064026373408505 | 0.776 | 0.467 | 0.281 | 0.602 | 0.362 |
| 2.067167966062094 | 0.773 | 0.462 | 0.276 | 0.598 | 0.357 |
| 2.070309558715684 | 0.771 | 0.458 | 0.272 | 0.594 | 0.353 |
| 2.073451151369273 | 0.768 | 0.453 | 0.267 | 0.59 | 0.348 |
| 2.076592744022863 | 0.765 | 0.448 | 0.262 | 0.586 | 0.343 |
| 2.079734336676452 | 0.763 | 0.443 | 0.258 | 0.582 | 0.338 |
| 2.082875929330042 | 0.76 | 0.439 | 0.253 | 0.577 | 0.333 |
| 2.086017521983632 | 0.757 | 0.434 | 0.249 | 0.573 | 0.329 |
| 2.089159114637221 | 0.755 | 0.43 | 0.245 | 0.569 | 0.324 |
| 2.092300707290811 | 0.752 | 0.425 | 0.24 | 0.565 | 0.319 |
| 2.095442299944401 | 0.749 | 0.42 | 0.236 | 0.561 | 0.315 |
| 2.09858389259799 | 0.746 | 0.416 | 0.232 | 0.557 | 0.31 |
| 2.10172548525158 | 0.744 | 0.411 | 0.227 | 0.553 | 0.306 |
| 2.104867077905169 | 0.741 | 0.407 | 0.223 | 0.549 | 0.301 |
| 2.108008670558759 | 0.738 | 0.402 | 0.219 | 0.545 | 0.297 |
| 2.111150263212349 | 0.735 | 0.398 | 0.215 | 0.541 | 0.292 |
| 2.114291855865938 | 0.733 | 0.393 | 0.211 | 0.537 | 0.288 |
| 2.117433448519528 | 0.73 | 0.389 | 0.207 | 0.533 | 0.284 |
| 2.120575041173117 | 0.727 | 0.384 | 0.203 | 0.529 | 0.279 |
| 2.123716633826707 | 0.724 | 0.38 | 0.199 | 0.524 | 0.275 |
| 2.126858226480297 | 0.721 | 0.375 | 0.195 | 0.52 | 0.271 |
| 2.129999819133886 | 0.719 | 0.371 | 0.192 | 0.516 | 0.267 |
| 2.133141411787476 | 0.716 | 0.367 | 0.188 | 0.512 | 0.262 |
| 2.136283004441065 | 0.713 | 0.362 | 0.184 | 0.508 | 0.258 |
| 2.139424597094655 | 0.71 | 0.358 | 0.18 | 0.504 | 0.254 |
| 2.142566189748245 | 0.707 | 0.354 | 0.177 | 0.5 | 0.25 |
| 2.145707782401834 | 0.704 | 0.349 | 0.173 | 0.496 | 0.246 |
| 2.148849375055424 | 0.701 | 0.345 | 0.17 | 0.492 | 0.242 |
| 2.151990967709013 | 0.699 | 0.341 | 0.166 | 0.488 | 0.238 |
| 2.155132560362603 | 0.696 | 0.337 | 0.163 | 0.484 | 0.234 |
| 2.158274153016193 | 0.693 | 0.333 | 0.16 | 0.48 | 0.23 |
| 2.161415745669782 | 0.69 | 0.328 | 0.156 | 0.476 | 0.227 |
| 2.164557338323372 | 0.687 | 0.324 | 0.153 | 0.472 | 0.223 |
| 2.167698930976961 | 0.684 | 0.32 | 0.15 | 0.468 | 0.219 |
| 2.170840523630551 | 0.681 | 0.316 | 0.147 | 0.464 | 0.215 |
| 2.173982116284141 | 0.678 | 0.312 | 0.143 | 0.46 | 0.212 |
| 2.17712370893773 | 0.675 | 0.308 | 0.14 | 0.456 | 0.208 |
| 2.18026530159132 | 0.672 | 0.304 | 0.137 | 0.452 | 0.204 |
| 2.183406894244909 | 0.669 | 0.3 | 0.134 | 0.448 | 0.201 |
| 2.186548486898499 | 0.666 | 0.296 | 0.131 | 0.444 | 0.197 |
| 2.189690079552089 | 0.663 | 0.292 | 0.129 | 0.44 | 0.194 |
| 2.192831672205678 | 0.66 | 0.288 | 0.126 | 0.436 | 0.19 |
| 2.195973264859268 | 0.657 | 0.284 | 0.123 | 0.432 | 0.187 |
| 2.199114857512857 | 0.655 | 0.28 | 0.12 | 0.428 | 0.184 |
| 2.202256450166447 | 0.652 | 0.277 | 0.117 | 0.424 | 0.18 |
| 2.205398042820036 | 0.649 | 0.273 | 0.115 | 0.421 | 0.177 |
| 2.208539635473626 | 0.646 | 0.269 | 0.112 | 0.417 | 0.174 |
| 2.211681228127216 | 0.643 | 0.265 | 0.109 | 0.413 | 0.17 |
| 2.214822820780805 | 0.639 | 0.262 | 0.107 | 0.409 | 0.167 |
| 2.217964413434395 | 0.636 | 0.258 | 0.104 | 0.405 | 0.164 |
| 2.221106006087984 | 0.633 | 0.254 | 0.102 | 0.401 | 0.161 |
| 2.224247598741574 | 0.63 | 0.251 | 0.1 | 0.397 | 0.158 |
| 2.227389191395164 | 0.627 | 0.247 | 0.097 | 0.394 | 0.155 |
| 2.230530784048753 | 0.624 | 0.243 | 0.095 | 0.39 | 0.152 |
| 2.233672376702343 | 0.621 | 0.24 | 0.093 | 0.386 | 0.149 |
| 2.236813969355933 | 0.618 | 0.236 | 0.09 | 0.382 | 0.146 |
| 2.239955562009522 | 0.615 | 0.233 | 0.088 | 0.378 | 0.143 |
| 2.243097154663112 | 0.612 | 0.229 | 0.086 | 0.375 | 0.14 |
| 2.246238747316701 | 0.609 | 0.226 | 0.084 | 0.371 | 0.138 |
| 2.249380339970291 | 0.606 | 0.223 | 0.082 | 0.367 | 0.135 |
| 2.252521932623881 | 0.603 | 0.219 | 0.08 | 0.364 | 0.132 |
| 2.25566352527747 | 0.6 | 0.216 | 0.078 | 0.36 | 0.129 |
| 2.25880511793106 | 0.597 | 0.213 | 0.076 | 0.356 | 0.127 |
| 2.261946710584649 | 0.594 | 0.209 | 0.074 | 0.352 | 0.124 |
| 2.265088303238239 | 0.591 | 0.206 | 0.072 | 0.349 | 0.122 |
| 2.268229895891829 | 0.588 | 0.203 | 0.07 | 0.345 | 0.119 |
| 2.271371488545418 | 0.584 | 0.2 | 0.068 | 0.342 | 0.117 |
| 2.274513081199008 | 0.581 | 0.196 | 0.066 | 0.338 | 0.114 |
| 2.277654673852597 | 0.578 | 0.193 | 0.065 | 0.334 | 0.112 |
| 2.280796266506186 | 0.575 | 0.19 | 0.063 | 0.331 | 0.109 |
| 2.283937859159776 | 0.572 | 0.187 | 0.061 | 0.327 | 0.107 |
| 2.287079451813366 | 0.569 | 0.184 | 0.06 | 0.324 | 0.105 |
| 2.290221044466955 | 0.566 | 0.181 | 0.058 | 0.32 | 0.102 |
| 2.293362637120545 | 0.563 | 0.178 | 0.056 | 0.317 | 0.1 |
| 2.296504229774135 | 0.56 | 0.175 | 0.055 | 0.313 | 0.098 |
| 2.299645822427724 | 0.556 | 0.172 | 0.053 | 0.31 | 0.096 |
| 2.302787415081314 | 0.553 | 0.169 | 0.052 | 0.306 | 0.094 |
| 2.305929007734904 | 0.55 | 0.167 | 0.05 | 0.303 | 0.092 |
| 2.309070600388493 | 0.547 | 0.164 | 0.049 | 0.299 | 0.09 |
| 2.312212193042083 | 0.544 | 0.161 | 0.048 | 0.296 | 0.088 |
| 2.315353785695672 | 0.541 | 0.158 | 0.046 | 0.292 | 0.086 |
| 2.318495378349262 | 0.538 | 0.155 | 0.045 | 0.289 | 0.084 |
| 2.321636971002852 | 0.535 | 0.153 | 0.044 | 0.286 | 0.082 |
| 2.324778563656441 | 0.531 | 0.15 | 0.042 | 0.282 | 0.08 |
| 2.327920156310031 | 0.528 | 0.147 | 0.041 | 0.279 | 0.078 |
| 2.33106174896362 | 0.525 | 0.145 | 0.04 | 0.276 | 0.076 |
| 2.33420334161721 | 0.522 | 0.142 | 0.039 | 0.272 | 0.074 |
| 2.3373449342708 | 0.519 | 0.14 | 0.038 | 0.269 | 0.072 |
| 2.340486526924389 | 0.516 | 0.137 | 0.036 | 0.266 | 0.071 |
| 2.343628119577979 | 0.513 | 0.135 | 0.035 | 0.263 | 0.069 |
| 2.346769712231568 | 0.509 | 0.132 | 0.034 | 0.26 | 0.067 |
| 2.349911304885158 | 0.506 | 0.13 | 0.033 | 0.256 | 0.066 |
| 2.353052897538748 | 0.503 | 0.127 | 0.032 | 0.253 | 0.064 |
| 2.356194490192337 | 0.5 | 0.125 | 0.031 | 0.25 | 0.063 |
| 2.359336082845927 | 0.497 | 0.123 | 0.03 | 0.247 | 0.061 |
| 2.362477675499516 | 0.494 | 0.12 | 0.029 | 0.244 | 0.059 |
| 2.365619268153106 | 0.491 | 0.118 | 0.028 | 0.241 | 0.058 |
| 2.368760860806696 | 0.487 | 0.116 | 0.028 | 0.238 | 0.056 |
| 2.371902453460285 | 0.484 | 0.114 | 0.027 | 0.235 | 0.055 |
| 2.375044046113875 | 0.481 | 0.111 | 0.026 | 0.232 | 0.054 |
| 2.378185638767464 | 0.478 | 0.109 | 0.025 | 0.228 | 0.052 |
| 2.381327231421054 | 0.475 | 0.107 | 0.024 | 0.226 | 0.051 |
| 2.384468824074644 | 0.472 | 0.105 | 0.023 | 0.223 | 0.05 |
| 2.387610416728233 | 0.469 | 0.103 | 0.023 | 0.22 | 0.048 |
| 2.390752009381823 | 0.465 | 0.101 | 0.022 | 0.217 | 0.047 |
| 2.393893602035412 | 0.462 | 0.099 | 0.021 | 0.214 | 0.046 |
| 2.397035194689002 | 0.459 | 0.097 | 0.02 | 0.211 | 0.044 |
| 2.400176787342591 | 0.456 | 0.095 | 0.02 | 0.208 | 0.043 |
| 2.403318379996181 | 0.453 | 0.093 | 0.019 | 0.205 | 0.042 |
| 2.406459972649771 | 0.45 | 0.091 | 0.018 | 0.202 | 0.041 |
| 2.40960156530336 | 0.447 | 0.089 | 0.018 | 0.2 | 0.04 |
| 2.41274315795695 | 0.444 | 0.087 | 0.017 | 0.197 | 0.039 |
| 2.41588475061054 | 0.44 | 0.085 | 0.017 | 0.194 | 0.038 |
| 2.419026343264129 | 0.437 | 0.084 | 0.016 | 0.191 | 0.037 |
| 2.422167935917719 | 0.434 | 0.082 | 0.015 | 0.189 | 0.036 |
| 2.425309528571308 | 0.431 | 0.08 | 0.015 | 0.186 | 0.035 |
| 2.428451121224898 | 0.428 | 0.078 | 0.014 | 0.183 | 0.034 |
| 2.431592713878488 | 0.425 | 0.077 | 0.014 | 0.181 | 0.033 |
| 2.434734306532077 | 0.422 | 0.075 | 0.013 | 0.178 | 0.032 |
| 2.437875899185667 | 0.419 | 0.073 | 0.013 | 0.175 | 0.031 |
| 2.441017491839256 | 0.416 | 0.072 | 0.012 | 0.173 | 0.03 |
| 2.444159084492846 | 0.412 | 0.07 | 0.012 | 0.17 | 0.029 |
| 2.447300677146435 | 0.409 | 0.069 | 0.012 | 0.168 | 0.028 |
| 2.450442269800025 | 0.406 | 0.067 | 0.011 | 0.165 | 0.027 |
| 2.453583862453615 | 0.403 | 0.066 | 0.011 | 0.163 | 0.026 |
| 2.456725455107204 | 0.4 | 0.064 | 0.01 | 0.16 | 0.026 |
| 2.459867047760794 | 0.397 | 0.063 | 0.01 | 0.158 | 0.025 |
| 2.463008640414384 | 0.394 | 0.061 | 0.009 | 0.155 | 0.024 |
| 2.466150233067973 | 0.391 | 0.06 | 0.009 | 0.153 | 0.023 |
| 2.469291825721563 | 0.388 | 0.058 | 0.009 | 0.15 | 0.023 |
| 2.472433418375152 | 0.385 | 0.057 | 0.008 | 0.148 | 0.022 |
| 2.475575011028742 | 0.382 | 0.056 | 0.008 | 0.146 | 0.021 |
| 2.478716603682332 | 0.379 | 0.054 | 0.008 | 0.143 | 0.021 |
| 2.481858196335921 | 0.376 | 0.053 | 0.007 | 0.141 | 0.02 |
| 2.48499978898951 | 0.373 | 0.052 | 0.007 | 0.139 | 0.019 |
| 2.4881413816431 | 0.37 | 0.05 | 0.007 | 0.137 | 0.019 |
| 2.49128297429669 | 0.367 | 0.049 | 0.007 | 0.134 | 0.018 |
| 2.49442456695028 | 0.364 | 0.048 | 0.006 | 0.132 | 0.017 |
| 2.497566159603869 | 0.361 | 0.047 | 0.006 | 0.13 | 0.017 |
| 2.500707752257458 | 0.357 | 0.046 | 0.006 | 0.128 | 0.016 |
| 2.503849344911048 | 0.354 | 0.045 | 0.006 | 0.126 | 0.016 |
| 2.506990937564638 | 0.351 | 0.043 | 0.005 | 0.124 | 0.015 |
| 2.510132530218228 | 0.348 | 0.042 | 0.005 | 0.121 | 0.015 |
| 2.513274122871817 | 0.345 | 0.041 | 0.005 | 0.119 | 0.014 |
| 2.516415715525407 | 0.343 | 0.04 | 0.005 | 0.117 | 0.014 |
| 2.519557308178996 | 0.34 | 0.039 | 0.005 | 0.115 | 0.013 |
| 2.522698900832586 | 0.337 | 0.038 | 0.004 | 0.113 | 0.013 |
| 2.525840493486176 | 0.334 | 0.037 | 0.004 | 0.111 | 0.012 |
| 2.528982086139765 | 0.331 | 0.036 | 0.004 | 0.109 | 0.012 |
| 2.532123678793355 | 0.328 | 0.035 | 0.004 | 0.107 | 0.012 |
| 2.535265271446944 | 0.325 | 0.034 | 0.004 | 0.105 | 0.011 |
| 2.538406864100534 | 0.322 | 0.033 | 0.003 | 0.104 | 0.011 |
| 2.541548456754124 | 0.319 | 0.032 | 0.003 | 0.102 | 0.01 |
| 2.544690049407713 | 0.316 | 0.032 | 0.003 | 0.1 | 0.01 |
| 2.547831642061302 | 0.313 | 0.031 | 0.003 | 0.098 | 0.01 |
| 2.550973234714892 | 0.31 | 0.03 | 0.003 | 0.096 | 0.009 |
| 2.554114827368482 | 0.307 | 0.029 | 0.003 | 0.094 | 0.009 |
| 2.557256420022072 | 0.304 | 0.028 | 0.003 | 0.093 | 0.009 |
| 2.560398012675661 | 0.301 | 0.027 | 0.002 | 0.091 | 0.008 |
| 2.563539605329251 | 0.299 | 0.027 | 0.002 | 0.089 | 0.008 |
| 2.56668119798284 | 0.296 | 0.026 | 0.002 | 0.087 | 0.008 |
| 2.56982279063643 | 0.293 | 0.025 | 0.002 | 0.086 | 0.007 |
| 2.57296438329002 | 0.29 | 0.024 | 0.002 | 0.084 | 0.007 |
| 2.576105975943609 | 0.287 | 0.024 | 0.002 | 0.082 | 0.007 |
| 2.579247568597199 | 0.284 | 0.023 | 0.002 | 0.081 | 0.007 |
| 2.582389161250788 | 0.281 | 0.022 | 0.002 | 0.079 | 0.006 |
| 2.585530753904377 | 0.279 | 0.022 | 0.002 | 0.078 | 0.006 |
| 2.588672346557967 | 0.276 | 0.021 | 0.002 | 0.076 | 0.006 |
| 2.591813939211557 | 0.273 | 0.02 | 0.002 | 0.075 | 0.006 |
| 2.594955531865147 | 0.27 | 0.02 | 0.001 | 0.073 | 0.005 |
| 2.598097124518736 | 0.267 | 0.019 | 0.001 | 0.072 | 0.005 |
| 2.601238717172326 | 0.265 | 0.019 | 0.001 | 0.07 | 0.005 |
| 2.604380309825915 | 0.262 | 0.018 | 0.001 | 0.069 | 0.005 |
| 2.607521902479505 | 0.259 | 0.017 | 0.001 | 0.067 | 0.005 |
| 2.610663495133095 | 0.256 | 0.017 | 0.001 | 0.066 | 0.004 |
| 2.613805087786684 | 0.254 | 0.016 | 0.001 | 0.064 | 0.004 |
| 2.616946680440274 | 0.251 | 0.016 | 0.001 | 0.063 | 0.004 |
| 2.620088273093863 | 0.248 | 0.015 | 0.001 | 0.062 | 0.004 |
| 2.623229865747452 | 0.245 | 0.015 | 0.001 | 0.06 | 0.004 |
| 2.626371458401042 | 0.243 | 0.014 | 0.001 | 0.059 | 0.003 |
| 2.629513051054632 | 0.24 | 0.014 | 0.001 | 0.058 | 0.003 |
| 2.632654643708222 | 0.237 | 0.013 | 0.001 | 0.056 | 0.003 |
| 2.635796236361811 | 0.235 | 0.013 | 0.001 | 0.055 | 0.003 |
| 2.638937829015401 | 0.232 | 0.013 | 0.001 | 0.054 | 0.003 |
| 2.642079421668991 | 0.229 | 0.012 | 0.001 | 0.053 | 0.003 |
| 2.64522101432258 | 0.227 | 0.012 | 0.001 | 0.051 | 0.003 |
| 2.64836260697617 | 0.224 | 0.011 | 0.001 | 0.05 | 0.003 |
| 2.651504199629759 | 0.222 | 0.011 | 0.001 | 0.049 | 0.002 |
| 2.654645792283349 | 0.219 | 0.01 | 0.001 | 0.048 | 0.002 |
| 2.657787384936938 | 0.216 | 0.01 | 0 | 0.047 | 0.002 |
| 2.660928977590528 | 0.214 | 0.01 | 0 | 0.046 | 0.002 |
| 2.664070570244118 | 0.211 | 0.009 | 0 | 0.045 | 0.002 |
| 2.667212162897707 | 0.209 | 0.009 | 0 | 0.044 | 0.002 |
| 2.670353755551297 | 0.206 | 0.009 | 0 | 0.042 | 0.002 |
| 2.673495348204887 | 0.204 | 0.008 | 0 | 0.041 | 0.002 |
| 2.676636940858476 | 0.201 | 0.008 | 0 | 0.04 | 0.002 |
| 2.679778533512066 | 0.199 | 0.008 | 0 | 0.039 | 0.002 |
| 2.682920126165655 | 0.196 | 0.008 | 0 | 0.038 | 0.001 |
| 2.686061718819245 | 0.194 | 0.007 | 0 | 0.037 | 0.001 |
| 2.689203311472835 | 0.191 | 0.007 | 0 | 0.037 | 0.001 |
| 2.692344904126424 | 0.189 | 0.007 | 0 | 0.036 | 0.001 |
| 2.695486496780014 | 0.186 | 0.006 | 0 | 0.035 | 0.001 |
| 2.698628089433603 | 0.184 | 0.006 | 0 | 0.034 | 0.001 |
| 2.701769682087193 | 0.181 | 0.006 | 0 | 0.033 | 0.001 |
| 2.704911274740782 | 0.179 | 0.006 | 0 | 0.032 | 0.001 |
| 2.708052867394372 | 0.176 | 0.005 | 0 | 0.031 | 0.001 |
| 2.711194460047962 | 0.174 | 0.005 | 0 | 0.03 | 0.001 |
| 2.714336052701551 | 0.172 | 0.005 | 0 | 0.029 | 0.001 |
| 2.717477645355141 | 0.169 | 0.005 | 0 | 0.029 | 0.001 |
| 2.720619238008731 | 0.167 | 0.005 | 0 | 0.028 | 0.001 |
| 2.72376083066232 | 0.165 | 0.004 | 0 | 0.027 | 0.001 |
| 2.72690242331591 | 0.162 | 0.004 | 0 | 0.026 | 0.001 |
| 2.730044015969499 | 0.16 | 0.004 | 0 | 0.026 | 0.001 |
| 2.733185608623089 | 0.158 | 0.004 | 0 | 0.025 | 0.001 |
| 2.736327201276678 | 0.155 | 0.004 | 0 | 0.024 | 0.001 |
| 2.739468793930268 | 0.153 | 0.004 | 0 | 0.023 | 0.001 |
| 2.742610386583858 | 0.151 | 0.003 | 0 | 0.023 | 0.001 |
| 2.745751979237447 | 0.149 | 0.003 | 0 | 0.022 | 0 |
| 2.748893571891036 | 0.146 | 0.003 | 0 | 0.021 | 0 |
| 2.752035164544627 | 0.144 | 0.003 | 0 | 0.021 | 0 |
| 2.755176757198216 | 0.142 | 0.003 | 0 | 0.02 | 0 |
| 2.758318349851806 | 0.14 | 0.003 | 0 | 0.02 | 0 |
| 2.761459942505395 | 0.138 | 0.003 | 0 | 0.019 | 0 |
| 2.764601535158985 | 0.136 | 0.002 | 0 | 0.018 | 0 |
| 2.767743127812574 | 0.133 | 0.002 | 0 | 0.018 | 0 |
| 2.770884720466164 | 0.131 | 0.002 | 0 | 0.017 | 0 |
| 2.774026313119754 | 0.129 | 0.002 | 0 | 0.017 | 0 |
| 2.777167905773343 | 0.127 | 0.002 | 0 | 0.016 | 0 |
| 2.780309498426932 | 0.125 | 0.002 | 0 | 0.016 | 0 |
| 2.783451091080522 | 0.123 | 0.002 | 0 | 0.015 | 0 |
| 2.786592683734112 | 0.121 | 0.002 | 0 | 0.015 | 0 |
| 2.789734276387701 | 0.119 | 0.002 | 0 | 0.014 | 0 |
| 2.792875869041291 | 0.117 | 0.002 | 0 | 0.014 | 0 |
| 2.796017461694881 | 0.115 | 0.002 | 0 | 0.013 | 0 |
| 2.79915905434847 | 0.113 | 0.001 | 0 | 0.013 | 0 |
| 2.80230064700206 | 0.111 | 0.001 | 0 | 0.012 | 0 |
| 2.80544223965565 | 0.109 | 0.001 | 0 | 0.012 | 0 |
| 2.808583832309239 | 0.107 | 0.001 | 0 | 0.011 | 0 |
| 2.811725424962829 | 0.105 | 0.001 | 0 | 0.011 | 0 |
| 2.814867017616419 | 0.103 | 0.001 | 0 | 0.011 | 0 |
| 2.818008610270008 | 0.101 | 0.001 | 0 | 0.01 | 0 |
| 2.821150202923598 | 0.099 | 0.001 | 0 | 0.01 | 0 |
| 2.824291795577187 | 0.097 | 0.001 | 0 | 0.009 | 0 |
| 2.827433388230777 | 0.095 | 0.001 | 0 | 0.009 | 0 |
| 2.830574980884366 | 0.094 | 0.001 | 0 | 0.009 | 0 |
| 2.833716573537956 | 0.092 | 0.001 | 0 | 0.008 | 0 |
| 2.836858166191546 | 0.09 | 0.001 | 0 | 0.008 | 0 |
| 2.839999758845135 | 0.088 | 0.001 | 0 | 0.008 | 0 |
| 2.843141351498725 | 0.086 | 0.001 | 0 | 0.007 | 0 |
| 2.846282944152314 | 0.085 | 0.001 | 0 | 0.007 | 0 |
| 2.849424536805904 | 0.083 | 0.001 | 0 | 0.007 | 0 |
| 2.852566129459494 | 0.081 | 0.001 | 0 | 0.007 | 0 |
| 2.855707722113083 | 0.08 | 0.001 | 0 | 0.006 | 0 |
| 2.858849314766673 | 0.078 | 0 | 0 | 0.006 | 0 |
| 2.861990907420262 | 0.076 | 0 | 0 | 0.006 | 0 |
| 2.865132500073852 | 0.075 | 0 | 0 | 0.006 | 0 |
| 2.868274092727442 | 0.073 | 0 | 0 | 0.005 | 0 |
| 2.871415685381031 | 0.071 | 0 | 0 | 0.005 | 0 |
| 2.874557278034621 | 0.07 | 0 | 0 | 0.005 | 0 |
| 2.87769887068821 | 0.068 | 0 | 0 | 0.005 | 0 |
| 2.8808404633418 | 0.066 | 0 | 0 | 0.004 | 0 |
| 2.88398205599539 | 0.065 | 0 | 0 | 0.004 | 0 |
| 2.88712364864898 | 0.063 | 0 | 0 | 0.004 | 0 |
| 2.890265241302569 | 0.062 | 0 | 0 | 0.004 | 0 |
| 2.893406833956158 | 0.06 | 0 | 0 | 0.004 | 0 |
| 2.896548426609748 | 0.059 | 0 | 0 | 0.003 | 0 |
| 2.899690019263338 | 0.057 | 0 | 0 | 0.003 | 0 |
| 2.902831611916927 | 0.056 | 0 | 0 | 0.003 | 0 |
| 2.905973204570517 | 0.054 | 0 | 0 | 0.003 | 0 |
| 2.909114797224106 | 0.053 | 0 | 0 | 0.003 | 0 |
| 2.912256389877696 | 0.052 | 0 | 0 | 0.003 | 0 |
| 2.915397982531286 | 0.05 | 0 | 0 | 0.003 | 0 |
| 2.918539575184875 | 0.049 | 0 | 0 | 0.002 | 0 |
| 2.921681167838465 | 0.048 | 0 | 0 | 0.002 | 0 |
| 2.924822760492054 | 0.046 | 0 | 0 | 0.002 | 0 |
| 2.927964353145644 | 0.045 | 0 | 0 | 0.002 | 0 |
| 2.931105945799234 | 0.044 | 0 | 0 | 0.002 | 0 |
| 2.934247538452823 | 0.042 | 0 | 0 | 0.002 | 0 |
| 2.937389131106413 | 0.041 | 0 | 0 | 0.002 | 0 |
| 2.940530723760002 | 0.04 | 0 | 0 | 0.002 | 0 |
| 2.943672316413592 | 0.039 | 0 | 0 | 0.001 | 0 |
| 2.946813909067182 | 0.037 | 0 | 0 | 0.001 | 0 |
| 2.949955501720771 | 0.036 | 0 | 0 | 0.001 | 0 |
| 2.953097094374361 | 0.035 | 0 | 0 | 0.001 | 0 |
| 2.95623868702795 | 0.034 | 0 | 0 | 0.001 | 0 |
| 2.95938027968154 | 0.033 | 0 | 0 | 0.001 | 0 |
| 2.96252187233513 | 0.032 | 0 | 0 | 0.001 | 0 |
| 2.965663464988719 | 0.031 | 0 | 0 | 0.001 | 0 |
| 2.968805057642309 | 0.03 | 0 | 0 | 0.001 | 0 |
| 2.971946650295898 | 0.029 | 0 | 0 | 0.001 | 0 |
| 2.975088242949488 | 0.027 | 0 | 0 | 0.001 | 0 |
| 2.978229835603078 | 0.026 | 0 | 0 | 0.001 | 0 |
| 2.981371428256667 | 0.025 | 0 | 0 | 0.001 | 0 |
| 2.984513020910257 | 0.024 | 0 | 0 | 0.001 | 0 |
| 2.987654613563846 | 0.024 | 0 | 0 | 0.001 | 0 |
| 2.990796206217436 | 0.023 | 0 | 0 | 0.001 | 0 |
| 2.993937798871025 | 0.022 | 0 | 0 | 0 | 0 |
| 2.997079391524615 | 0.021 | 0 | 0 | 0 | 0 |
| 3.000220984178205 | 0.02 | 0 | 0 | 0 | 0 |
| 3.003362576831794 | 0.019 | 0 | 0 | 0 | 0 |
| 3.006504169485384 | 0.018 | 0 | 0 | 0 | 0 |
| 3.009645762138974 | 0.017 | 0 | 0 | 0 | 0 |
| 3.012787354792563 | 0.016 | 0 | 0 | 0 | 0 |
| 3.015928947446153 | 0.016 | 0 | 0 | 0 | 0 |
| 3.019070540099742 | 0.015 | 0 | 0 | 0 | 0 |
| 3.022212132753332 | 0.014 | 0 | 0 | 0 | 0 |
| 3.025353725406922 | 0.013 | 0 | 0 | 0 | 0 |
| 3.028495318060511 | 0.013 | 0 | 0 | 0 | 0 |
| 3.031636910714101 | 0.012 | 0 | 0 | 0 | 0 |
| 3.03477850336769 | 0.011 | 0 | 0 | 0 | 0 |
| 3.03792009602128 | 0.011 | 0 | 0 | 0 | 0 |
| 3.04106168867487 | 0.01 | 0 | 0 | 0 | 0 |
| 3.04420328132846 | 0.009 | 0 | 0 | 0 | 0 |
| 3.047344873982049 | 0.009 | 0 | 0 | 0 | 0 |
| 3.050486466635638 | 0.008 | 0 | 0 | 0 | 0 |
| 3.053628059289228 | 0.008 | 0 | 0 | 0 | 0 |
| 3.056769651942818 | 0.007 | 0 | 0 | 0 | 0 |
| 3.059911244596407 | 0.007 | 0 | 0 | 0 | 0 |
| 3.063052837249997 | 0.006 | 0 | 0 | 0 | 0 |
| 3.066194429903586 | 0.006 | 0 | 0 | 0 | 0 |
| 3.069336022557176 | 0.005 | 0 | 0 | 0 | 0 |
| 3.072477615210766 | 0.005 | 0 | 0 | 0 | 0 |
| 3.075619207864355 | 0.004 | 0 | 0 | 0 | 0 |
| 3.078760800517945 | 0.004 | 0 | 0 | 0 | 0 |
| 3.081902393171534 | 0.004 | 0 | 0 | 0 | 0 |
| 3.085043985825124 | 0.003 | 0 | 0 | 0 | 0 |
| 3.088185578478713 | 0.003 | 0 | 0 | 0 | 0 |
| 3.091327171132303 | 0.003 | 0 | 0 | 0 | 0 |
| 3.094468763785893 | 0.002 | 0 | 0 | 0 | 0 |
| 3.097610356439482 | 0.002 | 0 | 0 | 0 | 0 |
| 3.100751949093072 | 0.002 | 0 | 0 | 0 | 0 |
| 3.103893541746661 | 0.001 | 0 | 0 | 0 | 0 |
| 3.107035134400251 | 0.001 | 0 | 0 | 0 | 0 |
| 3.110176727053841 | 0.001 | 0 | 0 | 0 | 0 |
| 3.11331831970743 | 0.001 | 0 | 0 | 0 | 0 |
| 3.11645991236102 | 0.001 | 0 | 0 | 0 | 0 |
| 3.11960150501461 | 0 | 0 | 0 | 0 | 0 |
| 3.122743097668199 | 0 | 0 | 0 | 0 | 0 |
| 3.125884690321789 | 0 | 0 | 0 | 0 | 0 |
| 3.129026282975378 | 0 | 0 | 0 | 0 | 0 |
| 3.132167875628968 | 0 | 0 | 0 | 0 | 0 |
| 3.135309468282557 | 0 | 0 | 0 | 0 | 0 |
| 3.138451060936147 | 0 | 0 | 0 | 0 | 0 |
| 3.141592653589737 | 0 | 0 | 0 | 0 | 0 |
| 3.144734246243326 | 0 | 0 | 0 | 0 | 0 |
| 3.147875838896916 | 0 | 0 | 0 | 0 | 0 |
| 3.151017431550505 | 0 | 0 | 0 | 0 | 0 |
| 3.154159024204095 | 0 | 0 | 0 | 0 | 0 |
| 3.157300616857685 | 0 | 0 | 0 | 0 | 0 |
| 3.160442209511274 | 0 | 0 | 0 | 0 | 0 |
| 3.163583802164864 | 0 | 0 | 0 | 0 | 0 |
| 3.166725394818453 | 0.001 | 0 | 0 | 0 | 0 |
| 3.169866987472043 | 0.001 | 0 | 0 | 0 | 0 |
| 3.173008580125633 | 0.001 | 0 | 0 | 0 | 0 |
| 3.176150172779222 | 0.001 | 0 | 0 | 0 | 0 |
| 3.179291765432812 | 0.001 | 0 | 0 | 0 | 0 |
| 3.182433358086401 | 0.002 | 0 | 0 | 0 | 0 |
| 3.185574950739991 | 0.002 | 0 | 0 | 0 | 0 |
| 3.188716543393581 | 0.002 | 0 | 0 | 0 | 0 |
| 3.19185813604717 | 0.003 | 0 | 0 | 0 | 0 |
| 3.19499972870076 | 0.003 | 0 | 0 | 0 | 0 |
| 3.198141321354349 | 0.003 | 0 | 0 | 0 | 0 |
| 3.20128291400794 | 0.004 | 0 | 0 | 0 | 0 |
| 3.204424506661528 | 0.004 | 0 | 0 | 0 | 0 |
| 3.207566099315118 | 0.004 | 0 | 0 | 0 | 0 |
| 3.210707691968708 | 0.005 | 0 | 0 | 0 | 0 |
| 3.213849284622297 | 0.005 | 0 | 0 | 0 | 0 |
| 3.216990877275887 | 0.006 | 0 | 0 | 0 | 0 |
| 3.220132469929476 | 0.006 | 0 | 0 | 0 | 0 |
| 3.223274062583066 | 0.007 | 0 | 0 | 0 | 0 |
| 3.226415655236656 | 0.007 | 0 | 0 | 0 | 0 |
| 3.229557247890245 | 0.008 | 0 | 0 | 0 | 0 |
| 3.232698840543835 | 0.008 | 0 | 0 | 0 | 0 |
| 3.235840433197425 | 0.009 | 0 | 0 | 0 | 0 |
| 3.238982025851014 | 0.009 | 0 | 0 | 0 | 0 |
| 3.242123618504604 | 0.01 | 0 | 0 | 0 | 0 |
| 3.245265211158193 | 0.011 | 0 | 0 | 0 | 0 |
| 3.248406803811783 | 0.011 | 0 | 0 | 0 | 0 |
| 3.251548396465373 | 0.012 | 0 | 0 | 0 | 0 |
| 3.254689989118962 | 0.013 | 0 | 0 | 0 | 0 |
| 3.257831581772551 | 0.013 | 0 | 0 | 0 | 0 |
| 3.260973174426141 | 0.014 | 0 | 0 | 0 | 0 |
| 3.26411476707973 | 0.015 | 0 | 0 | 0 | 0 |
| 3.267256359733321 | 0.016 | 0 | 0 | 0 | 0 |
| 3.27039795238691 | 0.016 | 0 | 0 | 0 | 0 |
| 3.2735395450405 | 0.017 | 0 | 0 | 0 | 0 |
| 3.276681137694089 | 0.018 | 0 | 0 | 0 | 0 |
| 3.279822730347679 | 0.019 | 0 | 0 | 0 | 0 |
| 3.282964323001269 | 0.02 | 0 | 0 | 0 | 0 |
| 3.286105915654858 | 0.021 | 0 | 0 | 0 | 0 |
| 3.289247508308448 | 0.022 | 0 | 0 | 0 | 0 |
| 3.292389100962037 | 0.023 | 0 | 0 | 0.001 | 0 |
| 3.295530693615627 | 0.024 | 0 | 0 | 0.001 | 0 |
| 3.298672286269217 | 0.024 | 0 | 0 | 0.001 | 0 |
| 3.301813878922806 | 0.025 | 0 | 0 | 0.001 | 0 |
| 3.304955471576396 | 0.026 | 0 | 0 | 0.001 | 0 |
| 3.308097064229985 | 0.027 | 0 | 0 | 0.001 | 0 |
| 3.311238656883575 | 0.029 | 0 | 0 | 0.001 | 0 |
| 3.314380249537165 | 0.03 | 0 | 0 | 0.001 | 0 |
| 3.317521842190754 | 0.031 | 0 | 0 | 0.001 | 0 |
| 3.320663434844344 | 0.032 | 0 | 0 | 0.001 | 0 |
| 3.323805027497933 | 0.033 | 0 | 0 | 0.001 | 0 |
| 3.326946620151523 | 0.034 | 0 | 0 | 0.001 | 0 |
| 3.330088212805113 | 0.035 | 0 | 0 | 0.001 | 0 |
| 3.333229805458702 | 0.036 | 0 | 0 | 0.001 | 0 |
| 3.336371398112292 | 0.037 | 0 | 0 | 0.001 | 0 |
| 3.339512990765881 | 0.039 | 0 | 0 | 0.001 | 0 |
| 3.342654583419471 | 0.04 | 0 | 0 | 0.002 | 0 |
| 3.345796176073061 | 0.041 | 0 | 0 | 0.002 | 0 |
| 3.34893776872665 | 0.042 | 0 | 0 | 0.002 | 0 |
| 3.35207936138024 | 0.044 | 0 | 0 | 0.002 | 0 |
| 3.355220954033829 | 0.045 | 0 | 0 | 0.002 | 0 |
| 3.358362546687419 | 0.046 | 0 | 0 | 0.002 | 0 |
| 3.361504139341009 | 0.048 | 0 | 0 | 0.002 | 0 |
| 3.364645731994598 | 0.049 | 0 | 0 | 0.002 | 0 |
| 3.367787324648188 | 0.05 | 0 | 0 | 0.003 | 0 |
| 3.370928917301777 | 0.052 | 0 | 0 | 0.003 | 0 |
| 3.374070509955367 | 0.053 | 0 | 0 | 0.003 | 0 |
| 3.377212102608956 | 0.054 | 0 | 0 | 0.003 | 0 |
| 3.380353695262546 | 0.056 | 0 | 0 | 0.003 | 0 |
| 3.383495287916136 | 0.057 | 0 | 0 | 0.003 | 0 |
| 3.386636880569725 | 0.059 | 0 | 0 | 0.003 | 0 |
| 3.389778473223315 | 0.06 | 0 | 0 | 0.004 | 0 |
| 3.392920065876904 | 0.062 | 0 | 0 | 0.004 | 0 |
| 3.396061658530494 | 0.063 | 0 | 0 | 0.004 | 0 |
| 3.399203251184084 | 0.065 | 0 | 0 | 0.004 | 0 |
| 3.402344843837673 | 0.066 | 0 | 0 | 0.004 | 0 |
| 3.405486436491263 | 0.068 | 0 | 0 | 0.005 | 0 |
| 3.408628029144852 | 0.07 | 0 | 0 | 0.005 | 0 |
| 3.411769621798442 | 0.071 | 0 | 0 | 0.005 | 0 |
| 3.414911214452032 | 0.073 | 0 | 0 | 0.005 | 0 |
| 3.418052807105621 | 0.075 | 0 | 0 | 0.006 | 0 |
| 3.421194399759211 | 0.076 | 0 | 0 | 0.006 | 0 |
| 3.4243359924128 | 0.078 | 0 | 0 | 0.006 | 0 |
| 3.42747758506639 | 0.08 | 0.001 | 0 | 0.006 | 0 |
| 3.43061917771998 | 0.081 | 0.001 | 0 | 0.007 | 0 |
| 3.433760770373569 | 0.083 | 0.001 | 0 | 0.007 | 0 |
| 3.436902363027159 | 0.085 | 0.001 | 0 | 0.007 | 0 |
| 3.440043955680748 | 0.086 | 0.001 | 0 | 0.007 | 0 |
| 3.443185548334338 | 0.088 | 0.001 | 0 | 0.008 | 0 |
| 3.446327140987927 | 0.09 | 0.001 | 0 | 0.008 | 0 |
| 3.449468733641517 | 0.092 | 0.001 | 0 | 0.008 | 0 |
| 3.452610326295107 | 0.094 | 0.001 | 0 | 0.009 | 0 |
| 3.455751918948696 | 0.095 | 0.001 | 0 | 0.009 | 0 |
| 3.458893511602286 | 0.097 | 0.001 | 0 | 0.009 | 0 |
| 3.462035104255876 | 0.099 | 0.001 | 0 | 0.01 | 0 |
| 3.465176696909465 | 0.101 | 0.001 | 0 | 0.01 | 0 |
| 3.468318289563055 | 0.103 | 0.001 | 0 | 0.011 | 0 |
| 3.471459882216644 | 0.105 | 0.001 | 0 | 0.011 | 0 |
| 3.474601474870234 | 0.107 | 0.001 | 0 | 0.011 | 0 |
| 3.477743067523824 | 0.109 | 0.001 | 0 | 0.012 | 0 |
| 3.480884660177413 | 0.111 | 0.001 | 0 | 0.012 | 0 |
| 3.484026252831002 | 0.113 | 0.001 | 0 | 0.013 | 0 |
| 3.487167845484592 | 0.115 | 0.002 | 0 | 0.013 | 0 |
| 3.490309438138182 | 0.117 | 0.002 | 0 | 0.014 | 0 |
| 3.493451030791772 | 0.119 | 0.002 | 0 | 0.014 | 0 |
| 3.496592623445361 | 0.121 | 0.002 | 0 | 0.015 | 0 |
| 3.499734216098951 | 0.123 | 0.002 | 0 | 0.015 | 0 |
| 3.50287580875254 | 0.125 | 0.002 | 0 | 0.016 | 0 |
| 3.50601740140613 | 0.127 | 0.002 | 0 | 0.016 | 0 |
| 3.50915899405972 | 0.129 | 0.002 | 0 | 0.017 | 0 |
| 3.512300586713309 | 0.131 | 0.002 | 0 | 0.017 | 0 |
| 3.515442179366899 | 0.133 | 0.002 | 0 | 0.018 | 0 |
| 3.518583772020488 | 0.136 | 0.002 | 0 | 0.018 | 0 |
| 3.521725364674078 | 0.138 | 0.003 | 0 | 0.019 | 0 |
| 3.524866957327668 | 0.14 | 0.003 | 0 | 0.02 | 0 |
| 3.528008549981257 | 0.142 | 0.003 | 0 | 0.02 | 0 |
| 3.531150142634847 | 0.144 | 0.003 | 0 | 0.021 | 0 |
| 3.534291735288436 | 0.146 | 0.003 | 0 | 0.021 | 0 |
| 3.537433327942026 | 0.149 | 0.003 | 0 | 0.022 | 0 |
| 3.540574920595616 | 0.151 | 0.003 | 0 | 0.023 | 0.001 |
| 3.543716513249205 | 0.153 | 0.004 | 0 | 0.023 | 0.001 |
| 3.546858105902795 | 0.155 | 0.004 | 0 | 0.024 | 0.001 |
| 3.549999698556384 | 0.158 | 0.004 | 0 | 0.025 | 0.001 |
| 3.553141291209974 | 0.16 | 0.004 | 0 | 0.026 | 0.001 |
| 3.556282883863564 | 0.162 | 0.004 | 0 | 0.026 | 0.001 |
| 3.559424476517153 | 0.165 | 0.004 | 0 | 0.027 | 0.001 |
| 3.562566069170743 | 0.167 | 0.005 | 0 | 0.028 | 0.001 |
| 3.565707661824332 | 0.169 | 0.005 | 0 | 0.029 | 0.001 |
| 3.568849254477922 | 0.172 | 0.005 | 0 | 0.029 | 0.001 |
| 3.571990847131511 | 0.174 | 0.005 | 0 | 0.03 | 0.001 |
| 3.575132439785101 | 0.176 | 0.005 | 0 | 0.031 | 0.001 |
| 3.578274032438691 | 0.179 | 0.006 | 0 | 0.032 | 0.001 |
| 3.58141562509228 | 0.181 | 0.006 | 0 | 0.033 | 0.001 |
| 3.58455721774587 | 0.184 | 0.006 | 0 | 0.034 | 0.001 |
| 3.58769881039946 | 0.186 | 0.006 | 0 | 0.035 | 0.001 |
| 3.590840403053049 | 0.189 | 0.007 | 0 | 0.036 | 0.001 |
| 3.593981995706639 | 0.191 | 0.007 | 0 | 0.037 | 0.001 |
| 3.597123588360228 | 0.194 | 0.007 | 0 | 0.037 | 0.001 |
| 3.600265181013818 | 0.196 | 0.008 | 0 | 0.038 | 0.001 |
| 3.603406773667407 | 0.199 | 0.008 | 0 | 0.039 | 0.002 |
| 3.606548366320997 | 0.201 | 0.008 | 0 | 0.04 | 0.002 |
| 3.609689958974587 | 0.204 | 0.008 | 0 | 0.041 | 0.002 |
| 3.612831551628176 | 0.206 | 0.009 | 0 | 0.042 | 0.002 |
| 3.615973144281766 | 0.209 | 0.009 | 0 | 0.044 | 0.002 |
| 3.619114736935355 | 0.211 | 0.009 | 0 | 0.045 | 0.002 |
| 3.622256329588945 | 0.214 | 0.01 | 0 | 0.046 | 0.002 |
| 3.625397922242534 | 0.216 | 0.01 | 0 | 0.047 | 0.002 |
| 3.628539514896124 | 0.219 | 0.01 | 0.001 | 0.048 | 0.002 |
| 3.631681107549714 | 0.222 | 0.011 | 0.001 | 0.049 | 0.002 |
| 3.634822700203303 | 0.224 | 0.011 | 0.001 | 0.05 | 0.003 |
| 3.637964292856893 | 0.227 | 0.012 | 0.001 | 0.051 | 0.003 |
| 3.641105885510483 | 0.229 | 0.012 | 0.001 | 0.053 | 0.003 |
| 3.644247478164072 | 0.232 | 0.013 | 0.001 | 0.054 | 0.003 |
| 3.647389070817662 | 0.235 | 0.013 | 0.001 | 0.055 | 0.003 |
| 3.650530663471251 | 0.237 | 0.013 | 0.001 | 0.056 | 0.003 |
| 3.653672256124841 | 0.24 | 0.014 | 0.001 | 0.058 | 0.003 |
| 3.656813848778431 | 0.243 | 0.014 | 0.001 | 0.059 | 0.003 |
| 3.65995544143202 | 0.245 | 0.015 | 0.001 | 0.06 | 0.004 |
| 3.66309703408561 | 0.248 | 0.015 | 0.001 | 0.062 | 0.004 |
| 3.666238626739199 | 0.251 | 0.016 | 0.001 | 0.063 | 0.004 |
| 3.66938021939279 | 0.254 | 0.016 | 0.001 | 0.064 | 0.004 |
| 3.672521812046378 | 0.256 | 0.017 | 0.001 | 0.066 | 0.004 |
| 3.675663404699968 | 0.259 | 0.017 | 0.001 | 0.067 | 0.005 |
| 3.678804997353558 | 0.262 | 0.018 | 0.001 | 0.069 | 0.005 |
| 3.681946590007147 | 0.265 | 0.019 | 0.001 | 0.07 | 0.005 |
| 3.685088182660737 | 0.267 | 0.019 | 0.001 | 0.072 | 0.005 |
| 3.688229775314326 | 0.27 | 0.02 | 0.001 | 0.073 | 0.005 |
| 3.691371367967916 | 0.273 | 0.02 | 0.002 | 0.075 | 0.006 |
| 3.694512960621506 | 0.276 | 0.021 | 0.002 | 0.076 | 0.006 |
| 3.697654553275095 | 0.279 | 0.022 | 0.002 | 0.078 | 0.006 |
| 3.700796145928685 | 0.281 | 0.022 | 0.002 | 0.079 | 0.006 |
| 3.703937738582274 | 0.284 | 0.023 | 0.002 | 0.081 | 0.007 |
| 3.707079331235864 | 0.287 | 0.024 | 0.002 | 0.082 | 0.007 |
| 3.710220923889454 | 0.29 | 0.024 | 0.002 | 0.084 | 0.007 |
| 3.713362516543043 | 0.293 | 0.025 | 0.002 | 0.086 | 0.007 |
| 3.716504109196633 | 0.296 | 0.026 | 0.002 | 0.087 | 0.008 |
| 3.719645701850223 | 0.299 | 0.027 | 0.002 | 0.089 | 0.008 |
| 3.722787294503812 | 0.301 | 0.027 | 0.002 | 0.091 | 0.008 |
| 3.725928887157402 | 0.304 | 0.028 | 0.003 | 0.093 | 0.009 |
| 3.729070479810991 | 0.307 | 0.029 | 0.003 | 0.094 | 0.009 |
| 3.732212072464581 | 0.31 | 0.03 | 0.003 | 0.096 | 0.009 |
| 3.735353665118171 | 0.313 | 0.031 | 0.003 | 0.098 | 0.01 |
| 3.73849525777176 | 0.316 | 0.032 | 0.003 | 0.1 | 0.01 |
| 3.74163685042535 | 0.319 | 0.032 | 0.003 | 0.102 | 0.01 |
| 3.744778443078939 | 0.322 | 0.033 | 0.003 | 0.104 | 0.011 |
| 3.747920035732529 | 0.325 | 0.034 | 0.004 | 0.105 | 0.011 |
| 3.751061628386119 | 0.328 | 0.035 | 0.004 | 0.107 | 0.012 |
| 3.754203221039708 | 0.331 | 0.036 | 0.004 | 0.109 | 0.012 |
| 3.757344813693298 | 0.334 | 0.037 | 0.004 | 0.111 | 0.012 |
| 3.760486406346887 | 0.337 | 0.038 | 0.004 | 0.113 | 0.013 |
| 3.763627999000477 | 0.34 | 0.039 | 0.005 | 0.115 | 0.013 |
| 3.766769591654067 | 0.343 | 0.04 | 0.005 | 0.117 | 0.014 |
| 3.769911184307656 | 0.345 | 0.041 | 0.005 | 0.119 | 0.014 |
| 3.773052776961246 | 0.348 | 0.042 | 0.005 | 0.121 | 0.015 |
| 3.776194369614835 | 0.351 | 0.043 | 0.005 | 0.124 | 0.015 |
| 3.779335962268425 | 0.354 | 0.045 | 0.006 | 0.126 | 0.016 |
| 3.782477554922014 | 0.357 | 0.046 | 0.006 | 0.128 | 0.016 |
| 3.785619147575604 | 0.361 | 0.047 | 0.006 | 0.13 | 0.017 |
| 3.788760740229193 | 0.364 | 0.048 | 0.006 | 0.132 | 0.017 |
| 3.791902332882783 | 0.367 | 0.049 | 0.007 | 0.134 | 0.018 |
| 3.795043925536373 | 0.37 | 0.05 | 0.007 | 0.137 | 0.019 |
| 3.798185518189962 | 0.373 | 0.052 | 0.007 | 0.139 | 0.019 |
| 3.801327110843552 | 0.376 | 0.053 | 0.007 | 0.141 | 0.02 |
| 3.804468703497142 | 0.379 | 0.054 | 0.008 | 0.143 | 0.021 |
| 3.807610296150731 | 0.382 | 0.056 | 0.008 | 0.146 | 0.021 |
| 3.810751888804321 | 0.385 | 0.057 | 0.008 | 0.148 | 0.022 |
| 3.813893481457911 | 0.388 | 0.058 | 0.009 | 0.15 | 0.023 |
| 3.8170350741115 | 0.391 | 0.06 | 0.009 | 0.153 | 0.023 |
| 3.82017666676509 | 0.394 | 0.061 | 0.009 | 0.155 | 0.024 |
| 3.823318259418679 | 0.397 | 0.063 | 0.01 | 0.158 | 0.025 |
| 3.826459852072269 | 0.4 | 0.064 | 0.01 | 0.16 | 0.026 |
| 3.829601444725859 | 0.403 | 0.066 | 0.011 | 0.163 | 0.026 |
| 3.832743037379448 | 0.406 | 0.067 | 0.011 | 0.165 | 0.027 |
| 3.835884630033038 | 0.409 | 0.069 | 0.012 | 0.168 | 0.028 |
| 3.839026222686627 | 0.412 | 0.07 | 0.012 | 0.17 | 0.029 |
| 3.842167815340217 | 0.416 | 0.072 | 0.012 | 0.173 | 0.03 |
| 3.845309407993807 | 0.419 | 0.073 | 0.013 | 0.175 | 0.031 |
| 3.848451000647396 | 0.422 | 0.075 | 0.013 | 0.178 | 0.032 |
| 3.851592593300986 | 0.425 | 0.077 | 0.014 | 0.181 | 0.033 |
| 3.854734185954575 | 0.428 | 0.078 | 0.014 | 0.183 | 0.034 |
| 3.857875778608165 | 0.431 | 0.08 | 0.015 | 0.186 | 0.035 |
| 3.861017371261755 | 0.434 | 0.082 | 0.015 | 0.189 | 0.036 |
| 3.864158963915344 | 0.437 | 0.084 | 0.016 | 0.191 | 0.037 |
| 3.867300556568933 | 0.44 | 0.085 | 0.017 | 0.194 | 0.038 |
| 3.870442149222523 | 0.444 | 0.087 | 0.017 | 0.197 | 0.039 |
| 3.873583741876112 | 0.447 | 0.089 | 0.018 | 0.2 | 0.04 |
| 3.876725334529703 | 0.45 | 0.091 | 0.018 | 0.202 | 0.041 |
| 3.879866927183292 | 0.453 | 0.093 | 0.019 | 0.205 | 0.042 |
| 3.883008519836882 | 0.456 | 0.095 | 0.02 | 0.208 | 0.043 |
| 3.886150112490471 | 0.459 | 0.097 | 0.02 | 0.211 | 0.044 |
| 3.889291705144061 | 0.462 | 0.099 | 0.021 | 0.214 | 0.046 |
| 3.892433297797651 | 0.465 | 0.101 | 0.022 | 0.217 | 0.047 |
| 3.89557489045124 | 0.469 | 0.103 | 0.023 | 0.22 | 0.048 |
| 3.89871648310483 | 0.472 | 0.105 | 0.023 | 0.223 | 0.05 |
| 3.901858075758419 | 0.475 | 0.107 | 0.024 | 0.226 | 0.051 |
| 3.904999668412009 | 0.478 | 0.109 | 0.025 | 0.228 | 0.052 |
| 3.908141261065598 | 0.481 | 0.111 | 0.026 | 0.232 | 0.054 |
| 3.911282853719188 | 0.484 | 0.114 | 0.027 | 0.235 | 0.055 |
| 3.914424446372778 | 0.487 | 0.116 | 0.028 | 0.238 | 0.056 |
| 3.917566039026367 | 0.491 | 0.118 | 0.028 | 0.241 | 0.058 |
| 3.920707631679957 | 0.494 | 0.12 | 0.029 | 0.244 | 0.059 |
| 3.923849224333547 | 0.497 | 0.123 | 0.03 | 0.247 | 0.061 |
| 3.926990816987136 | 0.5 | 0.125 | 0.031 | 0.25 | 0.062 |
| 3.930132409640726 | 0.503 | 0.127 | 0.032 | 0.253 | 0.064 |
| 3.933274002294315 | 0.506 | 0.13 | 0.033 | 0.256 | 0.066 |
| 3.936415594947905 | 0.509 | 0.132 | 0.034 | 0.26 | 0.067 |
| 3.939557187601495 | 0.513 | 0.135 | 0.035 | 0.263 | 0.069 |
| 3.942698780255084 | 0.516 | 0.137 | 0.036 | 0.266 | 0.071 |
| 3.945840372908674 | 0.519 | 0.14 | 0.038 | 0.269 | 0.072 |
| 3.948981965562263 | 0.522 | 0.142 | 0.039 | 0.272 | 0.074 |
| 3.952123558215853 | 0.525 | 0.145 | 0.04 | 0.276 | 0.076 |
| 3.955265150869442 | 0.528 | 0.147 | 0.041 | 0.279 | 0.078 |
| 3.958406743523032 | 0.531 | 0.15 | 0.042 | 0.282 | 0.08 |
| 3.961548336176622 | 0.535 | 0.153 | 0.044 | 0.286 | 0.082 |
| 3.964689928830211 | 0.538 | 0.155 | 0.045 | 0.289 | 0.084 |
| 3.967831521483801 | 0.541 | 0.158 | 0.046 | 0.292 | 0.086 |
| 3.97097311413739 | 0.544 | 0.161 | 0.048 | 0.296 | 0.088 |
| 3.97411470679098 | 0.547 | 0.164 | 0.049 | 0.299 | 0.09 |
| 3.97725629944457 | 0.55 | 0.167 | 0.05 | 0.303 | 0.092 |
| 3.98039789209816 | 0.553 | 0.169 | 0.052 | 0.306 | 0.094 |
| 3.983539484751749 | 0.556 | 0.172 | 0.053 | 0.31 | 0.096 |
| 3.986681077405338 | 0.56 | 0.175 | 0.055 | 0.313 | 0.098 |
| 3.989822670058928 | 0.563 | 0.178 | 0.056 | 0.317 | 0.1 |
| 3.992964262712517 | 0.566 | 0.181 | 0.058 | 0.32 | 0.102 |
| 3.996105855366107 | 0.569 | 0.184 | 0.06 | 0.324 | 0.105 |
| 3.999247448019697 | 0.572 | 0.187 | 0.061 | 0.327 | 0.107 |
| 4.002389040673287 | 0.575 | 0.19 | 0.063 | 0.331 | 0.109 |
| 4.005530633326877 | 0.578 | 0.193 | 0.065 | 0.334 | 0.112 |
| 4.008672225980466 | 0.581 | 0.196 | 0.066 | 0.338 | 0.114 |
| 4.011813818634056 | 0.584 | 0.2 | 0.068 | 0.342 | 0.117 |
| 4.014955411287645 | 0.588 | 0.203 | 0.07 | 0.345 | 0.119 |
| 4.018097003941234 | 0.591 | 0.206 | 0.072 | 0.349 | 0.122 |
| 4.021238596594824 | 0.594 | 0.209 | 0.074 | 0.352 | 0.124 |
| 4.024380189248414 | 0.597 | 0.213 | 0.076 | 0.356 | 0.127 |
| 4.027521781902004 | 0.6 | 0.216 | 0.078 | 0.36 | 0.129 |
| 4.030663374555593 | 0.603 | 0.219 | 0.08 | 0.364 | 0.132 |
| 4.033804967209183 | 0.606 | 0.223 | 0.082 | 0.367 | 0.135 |
| 4.036946559862773 | 0.609 | 0.226 | 0.084 | 0.371 | 0.138 |
| 4.040088152516362 | 0.612 | 0.229 | 0.086 | 0.375 | 0.14 |
| 4.043229745169951 | 0.615 | 0.233 | 0.088 | 0.378 | 0.143 |
| 4.046371337823541 | 0.618 | 0.236 | 0.09 | 0.382 | 0.146 |
| 4.049512930477131 | 0.621 | 0.24 | 0.093 | 0.386 | 0.149 |
| 4.05265452313072 | 0.624 | 0.243 | 0.095 | 0.39 | 0.152 |
| 4.05579611578431 | 0.627 | 0.247 | 0.097 | 0.394 | 0.155 |
| 4.0589377084379 | 0.63 | 0.251 | 0.1 | 0.397 | 0.158 |
| 4.062079301091489 | 0.633 | 0.254 | 0.102 | 0.401 | 0.161 |
| 4.065220893745079 | 0.636 | 0.258 | 0.104 | 0.405 | 0.164 |
| 4.068362486398668 | 0.639 | 0.262 | 0.107 | 0.409 | 0.167 |
| 4.071504079052258 | 0.643 | 0.265 | 0.109 | 0.413 | 0.17 |
| 4.074645671705848 | 0.646 | 0.269 | 0.112 | 0.417 | 0.174 |
| 4.077787264359437 | 0.649 | 0.273 | 0.115 | 0.421 | 0.177 |
| 4.080928857013027 | 0.652 | 0.277 | 0.117 | 0.424 | 0.18 |
| 4.084070449666616 | 0.655 | 0.28 | 0.12 | 0.428 | 0.184 |
| 4.087212042320206 | 0.657 | 0.284 | 0.123 | 0.432 | 0.187 |
| 4.090353634973795 | 0.66 | 0.288 | 0.126 | 0.436 | 0.19 |
| 4.093495227627385 | 0.663 | 0.292 | 0.129 | 0.44 | 0.194 |
| 4.096636820280975 | 0.666 | 0.296 | 0.131 | 0.444 | 0.197 |
| 4.099778412934564 | 0.669 | 0.3 | 0.134 | 0.448 | 0.201 |
| 4.102920005588154 | 0.672 | 0.304 | 0.137 | 0.452 | 0.204 |
| 4.106061598241744 | 0.675 | 0.308 | 0.14 | 0.456 | 0.208 |
| 4.109203190895333 | 0.678 | 0.312 | 0.143 | 0.46 | 0.212 |
| 4.112344783548923 | 0.681 | 0.316 | 0.147 | 0.464 | 0.215 |
| 4.115486376202512 | 0.684 | 0.32 | 0.15 | 0.468 | 0.219 |
| 4.118627968856102 | 0.687 | 0.324 | 0.153 | 0.472 | 0.223 |
| 4.121769561509692 | 0.69 | 0.328 | 0.156 | 0.476 | 0.227 |
| 4.124911154163281 | 0.693 | 0.333 | 0.16 | 0.48 | 0.23 |
| 4.128052746816871 | 0.696 | 0.337 | 0.163 | 0.484 | 0.234 |
| 4.13119433947046 | 0.699 | 0.341 | 0.166 | 0.488 | 0.238 |
| 4.13433593212405 | 0.701 | 0.345 | 0.17 | 0.492 | 0.242 |
| 4.13747752477764 | 0.704 | 0.349 | 0.173 | 0.496 | 0.246 |
| 4.14061911743123 | 0.707 | 0.354 | 0.177 | 0.5 | 0.25 |
| 4.143760710084818 | 0.71 | 0.358 | 0.18 | 0.504 | 0.254 |
| 4.146902302738408 | 0.713 | 0.362 | 0.184 | 0.508 | 0.258 |
| 4.150043895391998 | 0.716 | 0.367 | 0.188 | 0.512 | 0.262 |
| 4.153185488045588 | 0.719 | 0.371 | 0.192 | 0.516 | 0.267 |
| 4.156327080699177 | 0.721 | 0.375 | 0.195 | 0.52 | 0.271 |
| 4.159468673352766 | 0.724 | 0.38 | 0.199 | 0.524 | 0.275 |
| 4.162610266006356 | 0.727 | 0.384 | 0.203 | 0.529 | 0.279 |
| 4.165751858659946 | 0.73 | 0.389 | 0.207 | 0.533 | 0.284 |
| 4.168893451313535 | 0.733 | 0.393 | 0.211 | 0.537 | 0.288 |
| 4.172035043967125 | 0.735 | 0.398 | 0.215 | 0.541 | 0.292 |
| 4.175176636620715 | 0.738 | 0.402 | 0.219 | 0.545 | 0.297 |
| 4.178318229274304 | 0.741 | 0.407 | 0.223 | 0.549 | 0.301 |
| 4.181459821927894 | 0.744 | 0.411 | 0.227 | 0.553 | 0.306 |
| 4.184601414581484 | 0.746 | 0.416 | 0.232 | 0.557 | 0.31 |
| 4.187743007235073 | 0.749 | 0.42 | 0.236 | 0.561 | 0.315 |
| 4.190884599888663 | 0.752 | 0.425 | 0.24 | 0.565 | 0.319 |
| 4.194026192542252 | 0.755 | 0.43 | 0.245 | 0.569 | 0.324 |
| 4.197167785195842 | 0.757 | 0.434 | 0.249 | 0.573 | 0.329 |
| 4.200309377849432 | 0.76 | 0.439 | 0.253 | 0.577 | 0.333 |
| 4.203450970503021 | 0.763 | 0.443 | 0.258 | 0.582 | 0.338 |
| 4.206592563156611 | 0.765 | 0.448 | 0.262 | 0.586 | 0.343 |
| 4.2097341558102 | 0.768 | 0.453 | 0.267 | 0.59 | 0.348 |
| 4.21287574846379 | 0.771 | 0.458 | 0.272 | 0.594 | 0.353 |
| 4.21601734111738 | 0.773 | 0.462 | 0.276 | 0.598 | 0.357 |
| 4.21915893377097 | 0.776 | 0.467 | 0.281 | 0.602 | 0.362 |
| 4.222300526424559 | 0.778 | 0.472 | 0.286 | 0.606 | 0.367 |
| 4.225442119078148 | 0.781 | 0.476 | 0.291 | 0.61 | 0.372 |
| 4.228583711731738 | 0.784 | 0.481 | 0.296 | 0.614 | 0.377 |
| 4.231725304385327 | 0.786 | 0.486 | 0.3 | 0.618 | 0.382 |
| 4.234866897038917 | 0.789 | 0.491 | 0.305 | 0.622 | 0.387 |
| 4.238008489692506 | 0.791 | 0.496 | 0.31 | 0.626 | 0.392 |
| 4.241150082346096 | 0.794 | 0.5 | 0.315 | 0.63 | 0.397 |
| 4.244291674999685 | 0.796 | 0.505 | 0.32 | 0.634 | 0.402 |
| 4.247433267653276 | 0.799 | 0.51 | 0.326 | 0.638 | 0.407 |
| 4.250574860306865 | 0.801 | 0.515 | 0.331 | 0.642 | 0.413 |
| 4.253716452960455 | 0.804 | 0.52 | 0.336 | 0.646 | 0.418 |
| 4.256858045614044 | 0.806 | 0.524 | 0.341 | 0.65 | 0.423 |
| 4.259999638267634 | 0.809 | 0.529 | 0.346 | 0.654 | 0.428 |
| 4.263141230921224 | 0.811 | 0.534 | 0.352 | 0.658 | 0.433 |
| 4.266282823574813 | 0.814 | 0.539 | 0.357 | 0.662 | 0.439 |
| 4.269424416228403 | 0.816 | 0.544 | 0.362 | 0.666 | 0.444 |
| 4.272566008881992 | 0.819 | 0.549 | 0.368 | 0.67 | 0.449 |
| 4.275707601535582 | 0.821 | 0.554 | 0.373 | 0.674 | 0.455 |
| 4.27884919418917 | 0.824 | 0.559 | 0.379 | 0.678 | 0.46 |
| 4.28199078684276 | 0.826 | 0.563 | 0.384 | 0.682 | 0.465 |
| 4.285132379496351 | 0.828 | 0.568 | 0.39 | 0.686 | 0.471 |
| 4.28827397214994 | 0.831 | 0.573 | 0.395 | 0.69 | 0.476 |
| 4.29141556480353 | 0.833 | 0.578 | 0.401 | 0.694 | 0.481 |
| 4.294557157457119 | 0.835 | 0.583 | 0.407 | 0.698 | 0.487 |
| 4.29769875011071 | 0.838 | 0.588 | 0.412 | 0.702 | 0.492 |
| 4.300840342764299 | 0.84 | 0.593 | 0.418 | 0.706 | 0.498 |
| 4.303981935417888 | 0.842 | 0.598 | 0.424 | 0.709 | 0.503 |
| 4.307123528071478 | 0.845 | 0.602 | 0.43 | 0.713 | 0.509 |
| 4.310265120725067 | 0.847 | 0.607 | 0.435 | 0.717 | 0.514 |
| 4.313406713378657 | 0.849 | 0.612 | 0.441 | 0.721 | 0.52 |
| 4.316548306032247 | 0.851 | 0.617 | 0.447 | 0.725 | 0.525 |
| 4.319689898685836 | 0.854 | 0.622 | 0.453 | 0.729 | 0.531 |
| 4.322831491339426 | 0.856 | 0.627 | 0.459 | 0.732 | 0.536 |
| 4.325973083993015 | 0.858 | 0.632 | 0.465 | 0.736 | 0.542 |
| 4.329114676646605 | 0.86 | 0.636 | 0.471 | 0.74 | 0.547 |
| 4.332256269300195 | 0.862 | 0.641 | 0.477 | 0.744 | 0.553 |
| 4.335397861953784 | 0.864 | 0.646 | 0.483 | 0.747 | 0.559 |
| 4.338539454607374 | 0.867 | 0.651 | 0.489 | 0.751 | 0.564 |
| 4.341681047260963 | 0.869 | 0.656 | 0.495 | 0.755 | 0.57 |
| 4.344822639914553 | 0.871 | 0.66 | 0.501 | 0.758 | 0.575 |
| 4.347964232568143 | 0.873 | 0.665 | 0.507 | 0.762 | 0.581 |
| 4.351105825221732 | 0.875 | 0.67 | 0.513 | 0.766 | 0.586 |
| 4.354247417875322 | 0.877 | 0.675 | 0.519 | 0.769 | 0.592 |
| 4.357389010528911 | 0.879 | 0.68 | 0.525 | 0.773 | 0.597 |
| 4.360530603182501 | 0.881 | 0.684 | 0.531 | 0.777 | 0.603 |
| 4.36367219583609 | 0.883 | 0.689 | 0.538 | 0.78 | 0.609 |
| 4.36681378848968 | 0.885 | 0.694 | 0.544 | 0.784 | 0.614 |
| 4.36995538114327 | 0.887 | 0.698 | 0.55 | 0.787 | 0.62 |
| 4.373096973796859 | 0.889 | 0.703 | 0.556 | 0.791 | 0.625 |
| 4.376238566450449 | 0.891 | 0.708 | 0.562 | 0.794 | 0.631 |
| 4.379380159104038 | 0.893 | 0.712 | 0.568 | 0.798 | 0.636 |
| 4.382521751757628 | 0.895 | 0.717 | 0.575 | 0.801 | 0.642 |
| 4.385663344411217 | 0.897 | 0.722 | 0.581 | 0.805 | 0.647 |
| 4.388804937064807 | 0.899 | 0.726 | 0.587 | 0.808 | 0.653 |
| 4.391946529718397 | 0.901 | 0.731 | 0.593 | 0.811 | 0.658 |
| 4.395088122371987 | 0.903 | 0.735 | 0.599 | 0.815 | 0.664 |
| 4.398229715025576 | 0.905 | 0.74 | 0.605 | 0.818 | 0.669 |
| 4.401371307679165 | 0.906 | 0.745 | 0.612 | 0.821 | 0.675 |
| 4.404512900332755 | 0.908 | 0.749 | 0.618 | 0.825 | 0.68 |
| 4.407654492986345 | 0.91 | 0.754 | 0.624 | 0.828 | 0.686 |
| 4.410796085639934 | 0.912 | 0.758 | 0.63 | 0.831 | 0.691 |
| 4.413937678293524 | 0.914 | 0.762 | 0.636 | 0.835 | 0.696 |
| 4.417079270947114 | 0.915 | 0.767 | 0.642 | 0.838 | 0.702 |
| 4.420220863600703 | 0.917 | 0.771 | 0.649 | 0.841 | 0.707 |
| 4.423362456254293 | 0.919 | 0.776 | 0.655 | 0.844 | 0.713 |
| 4.426504048907883 | 0.92 | 0.78 | 0.661 | 0.847 | 0.718 |
| 4.429645641561472 | 0.922 | 0.784 | 0.667 | 0.85 | 0.723 |
| 4.432787234215062 | 0.924 | 0.788 | 0.673 | 0.853 | 0.728 |
| 4.435928826868651 | 0.925 | 0.793 | 0.679 | 0.857 | 0.734 |
| 4.43907041952224 | 0.927 | 0.797 | 0.685 | 0.86 | 0.739 |
| 4.44221201217583 | 0.929 | 0.801 | 0.691 | 0.863 | 0.744 |
| 4.44535360482942 | 0.93 | 0.805 | 0.697 | 0.866 | 0.749 |
| 4.44849519748301 | 0.932 | 0.809 | 0.703 | 0.869 | 0.754 |
| 4.4516367901366 | 0.934 | 0.814 | 0.709 | 0.871 | 0.759 |
| 4.454778382790188 | 0.935 | 0.818 | 0.715 | 0.874 | 0.765 |
| 4.457919975443779 | 0.937 | 0.822 | 0.721 | 0.877 | 0.77 |
| 4.461061568097368 | 0.938 | 0.826 | 0.727 | 0.88 | 0.775 |
| 4.464203160750958 | 0.94 | 0.83 | 0.733 | 0.883 | 0.78 |
| 4.467344753404547 | 0.941 | 0.834 | 0.738 | 0.886 | 0.785 |
| 4.470486346058137 | 0.943 | 0.838 | 0.744 | 0.889 | 0.789 |
| 4.473627938711726 | 0.944 | 0.841 | 0.75 | 0.891 | 0.794 |
| 4.476769531365316 | 0.946 | 0.845 | 0.756 | 0.894 | 0.799 |
| 4.479911124018905 | 0.947 | 0.849 | 0.761 | 0.897 | 0.804 |
| 4.483052716672495 | 0.948 | 0.853 | 0.767 | 0.899 | 0.809 |
| 4.486194309326085 | 0.95 | 0.857 | 0.773 | 0.902 | 0.813 |
| 4.489335901979674 | 0.951 | 0.86 | 0.778 | 0.905 | 0.818 |
| 4.492477494633264 | 0.952 | 0.864 | 0.784 | 0.907 | 0.823 |
| 4.495619087286854 | 0.954 | 0.868 | 0.789 | 0.91 | 0.827 |
| 4.498760679940443 | 0.955 | 0.871 | 0.795 | 0.912 | 0.832 |
| 4.501902272594033 | 0.956 | 0.875 | 0.8 | 0.915 | 0.836 |
| 4.505043865247622 | 0.958 | 0.878 | 0.805 | 0.917 | 0.841 |
| 4.508185457901212 | 0.959 | 0.882 | 0.811 | 0.919 | 0.845 |
| 4.511327050554801 | 0.96 | 0.885 | 0.816 | 0.922 | 0.85 |
| 4.514468643208391 | 0.961 | 0.888 | 0.821 | 0.924 | 0.854 |
| 4.517610235861981 | 0.963 | 0.892 | 0.826 | 0.926 | 0.858 |
| 4.520751828515571 | 0.964 | 0.895 | 0.831 | 0.929 | 0.863 |
| 4.52389342116916 | 0.965 | 0.898 | 0.836 | 0.931 | 0.867 |
| 4.52703501382275 | 0.966 | 0.902 | 0.841 | 0.933 | 0.871 |
| 4.530176606476339 | 0.967 | 0.905 | 0.846 | 0.935 | 0.875 |
| 4.533318199129928 | 0.968 | 0.908 | 0.851 | 0.938 | 0.879 |
| 4.536459791783518 | 0.969 | 0.911 | 0.856 | 0.94 | 0.883 |
| 4.539601384437108 | 0.97 | 0.914 | 0.861 | 0.942 | 0.887 |
| 4.542742977090698 | 0.971 | 0.917 | 0.865 | 0.944 | 0.891 |
| 4.545884569744287 | 0.973 | 0.92 | 0.87 | 0.946 | 0.895 |
| 4.549026162397876 | 0.974 | 0.923 | 0.875 | 0.948 | 0.898 |
| 4.552167755051466 | 0.975 | 0.926 | 0.879 | 0.95 | 0.902 |
| 4.555309347705056 | 0.976 | 0.928 | 0.883 | 0.952 | 0.906 |
| 4.558450940358646 | 0.976 | 0.931 | 0.888 | 0.954 | 0.909 |
| 4.561592533012235 | 0.977 | 0.934 | 0.892 | 0.955 | 0.913 |
| 4.564734125665825 | 0.978 | 0.936 | 0.896 | 0.957 | 0.916 |
| 4.567875718319415 | 0.979 | 0.939 | 0.901 | 0.959 | 0.92 |
| 4.571017310973004 | 0.98 | 0.942 | 0.905 | 0.961 | 0.923 |
| 4.574158903626594 | 0.981 | 0.944 | 0.909 | 0.962 | 0.926 |
| 4.577300496280183 | 0.982 | 0.947 | 0.913 | 0.964 | 0.929 |
| 4.580442088933772 | 0.983 | 0.949 | 0.916 | 0.966 | 0.933 |
| 4.583583681587362 | 0.984 | 0.951 | 0.92 | 0.967 | 0.936 |
| 4.586725274240952 | 0.984 | 0.954 | 0.924 | 0.969 | 0.939 |
| 4.589866866894542 | 0.985 | 0.956 | 0.928 | 0.97 | 0.942 |
| 4.593008459548131 | 0.986 | 0.958 | 0.931 | 0.972 | 0.944 |
| 4.596150052201721 | 0.987 | 0.96 | 0.935 | 0.973 | 0.947 |
| 4.59929164485531 | 0.987 | 0.962 | 0.938 | 0.975 | 0.95 |
| 4.6024332375089 | 0.988 | 0.964 | 0.941 | 0.976 | 0.953 |
| 4.60557483016249 | 0.989 | 0.966 | 0.944 | 0.977 | 0.955 |
| 4.608716422816079 | 0.989 | 0.968 | 0.948 | 0.979 | 0.958 |
| 4.611858015469668 | 0.99 | 0.97 | 0.951 | 0.98 | 0.96 |
| 4.614999608123258 | 0.991 | 0.972 | 0.954 | 0.981 | 0.963 |
| 4.618141200776848 | 0.991 | 0.974 | 0.956 | 0.982 | 0.965 |
| 4.621282793430437 | 0.992 | 0.975 | 0.959 | 0.984 | 0.967 |
| 4.624424386084027 | 0.992 | 0.977 | 0.962 | 0.985 | 0.969 |
| 4.627565978737617 | 0.993 | 0.979 | 0.965 | 0.986 | 0.972 |
| 4.630707571391206 | 0.993 | 0.98 | 0.967 | 0.987 | 0.974 |
| 4.633849164044795 | 0.994 | 0.982 | 0.97 | 0.988 | 0.976 |
| 4.636990756698386 | 0.994 | 0.983 | 0.972 | 0.989 | 0.977 |
| 4.640132349351975 | 0.995 | 0.984 | 0.974 | 0.99 | 0.979 |
| 4.643273942005564 | 0.995 | 0.986 | 0.976 | 0.99 | 0.981 |
| 4.646415534659154 | 0.996 | 0.987 | 0.978 | 0.991 | 0.983 |
| 4.649557127312744 | 0.996 | 0.988 | 0.98 | 0.992 | 0.984 |
| 4.652698719966334 | 0.996 | 0.989 | 0.982 | 0.993 | 0.986 |
| 4.655840312619923 | 0.997 | 0.99 | 0.984 | 0.994 | 0.987 |
| 4.658981905273513 | 0.997 | 0.991 | 0.986 | 0.994 | 0.989 |
| 4.662123497927102 | 0.997 | 0.992 | 0.987 | 0.995 | 0.99 |
| 4.665265090580692 | 0.998 | 0.993 | 0.989 | 0.996 | 0.991 |
| 4.668406683234282 | 0.998 | 0.994 | 0.99 | 0.996 | 0.992 |
| 4.671548275887871 | 0.998 | 0.995 | 0.992 | 0.997 | 0.993 |
| 4.674689868541461 | 0.999 | 0.996 | 0.993 | 0.997 | 0.994 |
| 4.67783146119505 | 0.999 | 0.996 | 0.994 | 0.998 | 0.995 |
| 4.68097305384864 | 0.999 | 0.997 | 0.995 | 0.998 | 0.996 |
| 4.68411464650223 | 0.999 | 0.998 | 0.996 | 0.998 | 0.997 |
| 4.687256239155819 | 0.999 | 0.998 | 0.997 | 0.999 | 0.997 |
| 4.690397831809409 | 1 | 0.999 | 0.998 | 0.999 | 0.998 |
| 4.693539424462998 | 1 | 0.999 | 0.998 | 0.999 | 0.999 |
| 4.696681017116588 | 1 | 0.999 | 0.999 | 1 | 0.999 |
| 4.699822609770177 | 1 | 1 | 0.999 | 1 | 0.999 |
| 4.702964202423767 | 1 | 1 | 1 | 1 | 1 |
| 4.706105795077356 | 1 | 1 | 1 | 1 | 1 |
| 4.709247387730946 | 1 | 1 | 1 | 1 | 1 |
| 4.712388980384535 | 1 | 1 | 1 | 1 | 1 |
| 4.715530573038126 | 1 | 1 | 1 | 1 | 1 |
| 4.718672165691715 | 1 | 1 | 1 | 1 | 1 |
| 4.721813758345305 | 1 | 1 | 1 | 1 | 1 |
| 4.724955350998894 | 1 | 1 | 0.999 | 1 | 0.999 |
| 4.728096943652484 | 1 | 0.999 | 0.999 | 1 | 0.999 |
| 4.731238536306074 | 1 | 0.999 | 0.998 | 0.999 | 0.999 |
| 4.734380128959663 | 1 | 0.999 | 0.998 | 0.999 | 0.998 |
| 4.737521721613253 | 0.999 | 0.998 | 0.997 | 0.999 | 0.997 |
| 4.740663314266842 | 0.999 | 0.998 | 0.996 | 0.998 | 0.997 |
| 4.743804906920432 | 0.999 | 0.997 | 0.995 | 0.998 | 0.996 |
| 4.74694649957402 | 0.999 | 0.996 | 0.994 | 0.998 | 0.995 |
| 4.750088092227611 | 0.999 | 0.996 | 0.993 | 0.997 | 0.994 |
| 4.7532296848812 | 0.998 | 0.995 | 0.992 | 0.997 | 0.993 |
| 4.75637127753479 | 0.998 | 0.994 | 0.99 | 0.996 | 0.992 |
| 4.75951287018838 | 0.998 | 0.993 | 0.989 | 0.996 | 0.991 |
| 4.76265446284197 | 0.997 | 0.992 | 0.987 | 0.995 | 0.99 |
| 4.765796055495559 | 0.997 | 0.991 | 0.986 | 0.994 | 0.989 |
| 4.768937648149149 | 0.997 | 0.99 | 0.984 | 0.994 | 0.987 |
| 4.772079240802738 | 0.996 | 0.989 | 0.982 | 0.993 | 0.986 |
| 4.775220833456327 | 0.996 | 0.988 | 0.98 | 0.992 | 0.984 |
| 4.778362426109917 | 0.996 | 0.987 | 0.978 | 0.991 | 0.983 |
| 4.781504018763507 | 0.995 | 0.986 | 0.976 | 0.99 | 0.981 |
| 4.784645611417097 | 0.995 | 0.984 | 0.974 | 0.99 | 0.979 |
| 4.787787204070686 | 0.994 | 0.983 | 0.972 | 0.989 | 0.977 |
| 4.790928796724275 | 0.994 | 0.982 | 0.97 | 0.988 | 0.976 |
| 4.794070389377865 | 0.993 | 0.98 | 0.967 | 0.987 | 0.974 |
| 4.797211982031455 | 0.993 | 0.979 | 0.965 | 0.986 | 0.972 |
| 4.800353574685045 | 0.992 | 0.977 | 0.962 | 0.985 | 0.969 |
| 4.803495167338634 | 0.992 | 0.975 | 0.959 | 0.984 | 0.967 |
| 4.806636759992224 | 0.991 | 0.974 | 0.956 | 0.982 | 0.965 |
| 4.809778352645814 | 0.991 | 0.972 | 0.954 | 0.981 | 0.963 |
| 4.812919945299403 | 0.99 | 0.97 | 0.951 | 0.98 | 0.96 |
| 4.816061537952993 | 0.989 | 0.968 | 0.948 | 0.979 | 0.958 |
| 4.819203130606582 | 0.989 | 0.966 | 0.944 | 0.977 | 0.955 |
| 4.822344723260172 | 0.988 | 0.964 | 0.941 | 0.976 | 0.953 |
| 4.825486315913761 | 0.987 | 0.962 | 0.938 | 0.975 | 0.95 |
| 4.828627908567351 | 0.987 | 0.96 | 0.935 | 0.973 | 0.947 |
| 4.83176950122094 | 0.986 | 0.958 | 0.931 | 0.972 | 0.944 |
| 4.83491109387453 | 0.985 | 0.956 | 0.928 | 0.97 | 0.942 |
| 4.83805268652812 | 0.984 | 0.954 | 0.924 | 0.969 | 0.939 |
| 4.841194279181709 | 0.984 | 0.951 | 0.92 | 0.967 | 0.936 |
| 4.844335871835299 | 0.983 | 0.949 | 0.916 | 0.966 | 0.933 |
| 4.847477464488889 | 0.982 | 0.947 | 0.913 | 0.964 | 0.929 |
| 4.850619057142478 | 0.981 | 0.944 | 0.909 | 0.962 | 0.926 |
| 4.853760649796068 | 0.98 | 0.942 | 0.905 | 0.961 | 0.923 |
| 4.856902242449657 | 0.979 | 0.939 | 0.901 | 0.959 | 0.92 |
| 4.860043835103247 | 0.978 | 0.936 | 0.896 | 0.957 | 0.916 |
| 4.863185427756837 | 0.977 | 0.934 | 0.892 | 0.955 | 0.913 |
| 4.866327020410426 | 0.976 | 0.931 | 0.888 | 0.954 | 0.909 |
| 4.869468613064015 | 0.976 | 0.928 | 0.883 | 0.952 | 0.906 |
| 4.872610205717605 | 0.975 | 0.926 | 0.879 | 0.95 | 0.902 |
| 4.875751798371195 | 0.974 | 0.923 | 0.875 | 0.948 | 0.898 |
| 4.878893391024784 | 0.973 | 0.92 | 0.87 | 0.946 | 0.895 |
| 4.882034983678374 | 0.971 | 0.917 | 0.865 | 0.944 | 0.891 |
| 4.885176576331964 | 0.97 | 0.914 | 0.861 | 0.942 | 0.887 |
| 4.888318168985553 | 0.969 | 0.911 | 0.856 | 0.94 | 0.883 |
| 4.891459761639143 | 0.968 | 0.908 | 0.851 | 0.938 | 0.879 |
| 4.894601354292733 | 0.967 | 0.905 | 0.846 | 0.935 | 0.875 |
| 4.897742946946322 | 0.966 | 0.902 | 0.841 | 0.933 | 0.871 |
| 4.900884539599912 | 0.965 | 0.898 | 0.836 | 0.931 | 0.867 |
| 4.904026132253501 | 0.964 | 0.895 | 0.831 | 0.929 | 0.863 |
| 4.907167724907091 | 0.963 | 0.892 | 0.826 | 0.926 | 0.858 |
| 4.91030931756068 | 0.961 | 0.888 | 0.821 | 0.924 | 0.854 |
| 4.91345091021427 | 0.96 | 0.885 | 0.816 | 0.922 | 0.85 |
| 4.91659250286786 | 0.959 | 0.882 | 0.811 | 0.919 | 0.845 |
| 4.91973409552145 | 0.958 | 0.878 | 0.805 | 0.917 | 0.841 |
| 4.922875688175039 | 0.956 | 0.875 | 0.8 | 0.915 | 0.836 |
| 4.926017280828628 | 0.955 | 0.871 | 0.795 | 0.912 | 0.832 |
| 4.929158873482218 | 0.954 | 0.868 | 0.789 | 0.91 | 0.827 |
| 4.932300466135808 | 0.952 | 0.864 | 0.784 | 0.907 | 0.823 |
| 4.935442058789397 | 0.951 | 0.86 | 0.778 | 0.905 | 0.818 |
| 4.938583651442987 | 0.95 | 0.857 | 0.773 | 0.902 | 0.813 |
| 4.941725244096576 | 0.948 | 0.853 | 0.767 | 0.899 | 0.809 |
| 4.944866836750166 | 0.947 | 0.849 | 0.761 | 0.897 | 0.804 |
| 4.948008429403755 | 0.946 | 0.845 | 0.756 | 0.894 | 0.799 |
| 4.951150022057345 | 0.944 | 0.841 | 0.75 | 0.891 | 0.794 |
| 4.954291614710935 | 0.943 | 0.838 | 0.744 | 0.889 | 0.789 |
| 4.957433207364524 | 0.941 | 0.834 | 0.738 | 0.886 | 0.785 |
| 4.960574800018114 | 0.94 | 0.83 | 0.733 | 0.883 | 0.78 |
| 4.963716392671704 | 0.938 | 0.826 | 0.727 | 0.88 | 0.775 |
| 4.966857985325293 | 0.937 | 0.822 | 0.721 | 0.877 | 0.77 |
| 4.969999577978883 | 0.935 | 0.818 | 0.715 | 0.874 | 0.765 |
| 4.973141170632472 | 0.934 | 0.814 | 0.709 | 0.871 | 0.759 |
| 4.976282763286062 | 0.932 | 0.809 | 0.703 | 0.869 | 0.754 |
| 4.979424355939651 | 0.93 | 0.805 | 0.697 | 0.866 | 0.749 |
| 4.982565948593241 | 0.929 | 0.801 | 0.691 | 0.863 | 0.744 |
| 4.985707541246831 | 0.927 | 0.797 | 0.685 | 0.86 | 0.739 |
| 4.98884913390042 | 0.925 | 0.793 | 0.679 | 0.857 | 0.734 |
| 4.99199072655401 | 0.924 | 0.788 | 0.673 | 0.853 | 0.728 |
| 4.9951323192076 | 0.922 | 0.784 | 0.667 | 0.85 | 0.723 |
| 4.99827391186119 | 0.92 | 0.78 | 0.661 | 0.847 | 0.718 |
| 5.00141550451478 | 0.919 | 0.776 | 0.655 | 0.844 | 0.713 |
| 5.004557097168369 | 0.917 | 0.771 | 0.649 | 0.841 | 0.707 |
| 5.007698689821958 | 0.915 | 0.767 | 0.642 | 0.838 | 0.702 |
| 5.010840282475548 | 0.914 | 0.762 | 0.636 | 0.835 | 0.696 |
| 5.013981875129137 | 0.912 | 0.758 | 0.63 | 0.831 | 0.691 |
| 5.017123467782727 | 0.91 | 0.754 | 0.624 | 0.828 | 0.686 |
| 5.020265060436317 | 0.908 | 0.749 | 0.618 | 0.825 | 0.68 |
| 5.023406653089906 | 0.906 | 0.745 | 0.612 | 0.821 | 0.675 |
| 5.026548245743496 | 0.905 | 0.74 | 0.605 | 0.818 | 0.669 |
| 5.029689838397085 | 0.903 | 0.735 | 0.599 | 0.815 | 0.664 |
| 5.032831431050674 | 0.901 | 0.731 | 0.593 | 0.811 | 0.658 |
| 5.035973023704264 | 0.899 | 0.726 | 0.587 | 0.808 | 0.653 |
| 5.039114616357854 | 0.897 | 0.722 | 0.581 | 0.805 | 0.647 |
| 5.042256209011444 | 0.895 | 0.717 | 0.575 | 0.801 | 0.642 |
| 5.045397801665033 | 0.893 | 0.712 | 0.568 | 0.798 | 0.636 |
| 5.048539394318622 | 0.891 | 0.708 | 0.562 | 0.794 | 0.631 |
| 5.051680986972213 | 0.889 | 0.703 | 0.556 | 0.791 | 0.625 |
| 5.054822579625802 | 0.887 | 0.698 | 0.55 | 0.787 | 0.62 |
| 5.057964172279392 | 0.885 | 0.694 | 0.544 | 0.784 | 0.614 |
| 5.061105764932981 | 0.883 | 0.689 | 0.538 | 0.78 | 0.609 |
| 5.064247357586571 | 0.881 | 0.684 | 0.531 | 0.777 | 0.603 |
| 5.067388950240161 | 0.879 | 0.68 | 0.525 | 0.773 | 0.597 |
| 5.07053054289375 | 0.877 | 0.675 | 0.519 | 0.769 | 0.592 |
| 5.07367213554734 | 0.875 | 0.67 | 0.513 | 0.766 | 0.586 |
| 5.07681372820093 | 0.873 | 0.665 | 0.507 | 0.762 | 0.581 |
| 5.079955320854519 | 0.871 | 0.66 | 0.501 | 0.758 | 0.575 |
| 5.083096913508108 | 0.869 | 0.656 | 0.495 | 0.755 | 0.57 |
| 5.086238506161698 | 0.867 | 0.651 | 0.489 | 0.751 | 0.564 |
| 5.089380098815288 | 0.864 | 0.646 | 0.483 | 0.747 | 0.559 |
| 5.092521691468877 | 0.862 | 0.641 | 0.477 | 0.744 | 0.553 |
| 5.095663284122466 | 0.86 | 0.636 | 0.471 | 0.74 | 0.547 |
| 5.098804876776057 | 0.858 | 0.632 | 0.465 | 0.736 | 0.542 |
| 5.101946469429646 | 0.856 | 0.627 | 0.459 | 0.732 | 0.536 |
| 5.105088062083236 | 0.854 | 0.622 | 0.453 | 0.729 | 0.531 |
| 5.108229654736825 | 0.851 | 0.617 | 0.447 | 0.725 | 0.525 |
| 5.111371247390415 | 0.849 | 0.612 | 0.441 | 0.721 | 0.52 |
| 5.114512840044005 | 0.847 | 0.607 | 0.435 | 0.717 | 0.514 |
| 5.117654432697594 | 0.845 | 0.602 | 0.43 | 0.713 | 0.509 |
| 5.120796025351184 | 0.842 | 0.598 | 0.424 | 0.709 | 0.503 |
| 5.123937618004773 | 0.84 | 0.593 | 0.418 | 0.706 | 0.498 |
| 5.127079210658363 | 0.838 | 0.588 | 0.412 | 0.702 | 0.492 |
| 5.130220803311953 | 0.835 | 0.583 | 0.407 | 0.698 | 0.487 |
| 5.133362395965542 | 0.833 | 0.578 | 0.401 | 0.694 | 0.481 |
| 5.136503988619131 | 0.831 | 0.573 | 0.395 | 0.69 | 0.476 |
| 5.13964558127272 | 0.828 | 0.568 | 0.39 | 0.686 | 0.471 |
| 5.142787173926311 | 0.826 | 0.563 | 0.384 | 0.682 | 0.465 |
| 5.1459287665799 | 0.824 | 0.559 | 0.379 | 0.678 | 0.46 |
| 5.14907035923349 | 0.821 | 0.554 | 0.373 | 0.674 | 0.455 |
| 5.15221195188708 | 0.819 | 0.549 | 0.368 | 0.67 | 0.449 |
| 5.15535354454067 | 0.816 | 0.544 | 0.362 | 0.666 | 0.444 |
| 5.158495137194259 | 0.814 | 0.539 | 0.357 | 0.662 | 0.439 |
| 5.161636729847848 | 0.811 | 0.534 | 0.352 | 0.658 | 0.433 |
| 5.164778322501438 | 0.809 | 0.529 | 0.346 | 0.654 | 0.428 |
| 5.167919915155028 | 0.806 | 0.524 | 0.341 | 0.65 | 0.423 |
| 5.171061507808617 | 0.804 | 0.52 | 0.336 | 0.646 | 0.418 |
| 5.174203100462206 | 0.801 | 0.515 | 0.331 | 0.642 | 0.413 |
| 5.177344693115796 | 0.799 | 0.51 | 0.326 | 0.638 | 0.407 |
| 5.180486285769386 | 0.796 | 0.505 | 0.32 | 0.634 | 0.402 |
| 5.183627878422976 | 0.794 | 0.5 | 0.315 | 0.63 | 0.397 |
| 5.186769471076565 | 0.791 | 0.496 | 0.31 | 0.626 | 0.392 |
| 5.189911063730155 | 0.789 | 0.491 | 0.305 | 0.622 | 0.387 |
| 5.193052656383744 | 0.786 | 0.486 | 0.3 | 0.618 | 0.382 |
| 5.196194249037334 | 0.784 | 0.481 | 0.296 | 0.614 | 0.377 |
| 5.199335841690924 | 0.781 | 0.476 | 0.291 | 0.61 | 0.372 |
| 5.202477434344513 | 0.778 | 0.472 | 0.286 | 0.606 | 0.367 |
| 5.205619026998103 | 0.776 | 0.467 | 0.281 | 0.602 | 0.362 |
| 5.208760619651692 | 0.773 | 0.462 | 0.276 | 0.598 | 0.357 |
| 5.211902212305282 | 0.771 | 0.458 | 0.272 | 0.594 | 0.353 |
| 5.215043804958871 | 0.768 | 0.453 | 0.267 | 0.59 | 0.348 |
| 5.218185397612461 | 0.765 | 0.448 | 0.262 | 0.586 | 0.343 |
| 5.221326990266051 | 0.763 | 0.443 | 0.258 | 0.582 | 0.338 |
| 5.22446858291964 | 0.76 | 0.439 | 0.253 | 0.577 | 0.333 |
| 5.22761017557323 | 0.757 | 0.434 | 0.249 | 0.573 | 0.329 |
| 5.23075176822682 | 0.755 | 0.43 | 0.245 | 0.569 | 0.324 |
| 5.23389336088041 | 0.752 | 0.425 | 0.24 | 0.565 | 0.319 |
| 5.237034953533999 | 0.749 | 0.42 | 0.236 | 0.561 | 0.315 |
| 5.240176546187588 | 0.746 | 0.416 | 0.232 | 0.557 | 0.31 |
| 5.243318138841178 | 0.744 | 0.411 | 0.227 | 0.553 | 0.306 |
| 5.246459731494767 | 0.741 | 0.407 | 0.223 | 0.549 | 0.301 |
| 5.249601324148357 | 0.738 | 0.402 | 0.219 | 0.545 | 0.297 |
| 5.252742916801947 | 0.735 | 0.398 | 0.215 | 0.541 | 0.292 |
| 5.255884509455536 | 0.733 | 0.393 | 0.211 | 0.537 | 0.288 |
| 5.259026102109125 | 0.73 | 0.389 | 0.207 | 0.533 | 0.284 |
| 5.262167694762715 | 0.727 | 0.384 | 0.203 | 0.529 | 0.279 |
| 5.265309287416305 | 0.724 | 0.38 | 0.199 | 0.524 | 0.275 |
| 5.268450880069895 | 0.721 | 0.375 | 0.195 | 0.52 | 0.271 |
| 5.271592472723484 | 0.719 | 0.371 | 0.192 | 0.516 | 0.267 |
| 5.274734065377074 | 0.716 | 0.367 | 0.188 | 0.512 | 0.262 |
| 5.277875658030664 | 0.713 | 0.362 | 0.184 | 0.508 | 0.258 |
| 5.281017250684253 | 0.71 | 0.358 | 0.18 | 0.504 | 0.254 |
| 5.284158843337843 | 0.707 | 0.354 | 0.177 | 0.5 | 0.25 |
| 5.287300435991432 | 0.704 | 0.349 | 0.173 | 0.496 | 0.246 |
| 5.290442028645022 | 0.701 | 0.345 | 0.17 | 0.492 | 0.242 |
| 5.293583621298612 | 0.699 | 0.341 | 0.166 | 0.488 | 0.238 |
| 5.296725213952201 | 0.696 | 0.337 | 0.163 | 0.484 | 0.234 |
| 5.299866806605791 | 0.693 | 0.333 | 0.16 | 0.48 | 0.23 |
| 5.30300839925938 | 0.69 | 0.328 | 0.156 | 0.476 | 0.227 |
| 5.30614999191297 | 0.687 | 0.324 | 0.153 | 0.472 | 0.223 |
| 5.30929158456656 | 0.684 | 0.32 | 0.15 | 0.468 | 0.219 |
| 5.312433177220149 | 0.681 | 0.316 | 0.147 | 0.464 | 0.215 |
| 5.315574769873739 | 0.678 | 0.312 | 0.143 | 0.46 | 0.212 |
| 5.318716362527328 | 0.675 | 0.308 | 0.14 | 0.456 | 0.208 |
| 5.321857955180918 | 0.672 | 0.304 | 0.137 | 0.452 | 0.204 |
| 5.324999547834508 | 0.669 | 0.3 | 0.134 | 0.448 | 0.201 |
| 5.328141140488097 | 0.666 | 0.296 | 0.131 | 0.444 | 0.197 |
| 5.331282733141686 | 0.663 | 0.292 | 0.129 | 0.44 | 0.194 |
| 5.334424325795276 | 0.66 | 0.288 | 0.126 | 0.436 | 0.19 |
| 5.337565918448866 | 0.657 | 0.284 | 0.123 | 0.432 | 0.187 |
| 5.340707511102456 | 0.655 | 0.28 | 0.12 | 0.428 | 0.184 |
| 5.343849103756045 | 0.652 | 0.277 | 0.117 | 0.424 | 0.18 |
| 5.346990696409634 | 0.649 | 0.273 | 0.115 | 0.421 | 0.177 |
| 5.350132289063224 | 0.646 | 0.269 | 0.112 | 0.417 | 0.174 |
| 5.353273881716814 | 0.643 | 0.265 | 0.109 | 0.413 | 0.17 |
| 5.356415474370403 | 0.639 | 0.262 | 0.107 | 0.409 | 0.167 |
| 5.359557067023993 | 0.636 | 0.258 | 0.104 | 0.405 | 0.164 |
| 5.362698659677583 | 0.633 | 0.254 | 0.102 | 0.401 | 0.161 |
| 5.365840252331172 | 0.63 | 0.251 | 0.1 | 0.397 | 0.158 |
| 5.368981844984762 | 0.627 | 0.247 | 0.097 | 0.394 | 0.155 |
| 5.372123437638351 | 0.624 | 0.243 | 0.095 | 0.39 | 0.152 |
| 5.375265030291941 | 0.621 | 0.24 | 0.093 | 0.386 | 0.149 |
| 5.378406622945531 | 0.618 | 0.236 | 0.09 | 0.382 | 0.146 |
| 5.38154821559912 | 0.615 | 0.233 | 0.088 | 0.378 | 0.143 |
| 5.38468980825271 | 0.612 | 0.229 | 0.086 | 0.375 | 0.14 |
| 5.387831400906299 | 0.609 | 0.226 | 0.084 | 0.371 | 0.138 |
| 5.39097299355989 | 0.606 | 0.223 | 0.082 | 0.367 | 0.135 |
| 5.394114586213479 | 0.603 | 0.219 | 0.08 | 0.364 | 0.132 |
| 5.397256178867068 | 0.6 | 0.216 | 0.078 | 0.36 | 0.129 |
| 5.400397771520657 | 0.597 | 0.213 | 0.076 | 0.356 | 0.127 |
| 5.403539364174247 | 0.594 | 0.209 | 0.074 | 0.352 | 0.124 |
| 5.406680956827837 | 0.591 | 0.206 | 0.072 | 0.349 | 0.122 |
| 5.409822549481426 | 0.588 | 0.203 | 0.07 | 0.345 | 0.119 |
| 5.412964142135016 | 0.584 | 0.2 | 0.068 | 0.342 | 0.117 |
| 5.416105734788605 | 0.581 | 0.196 | 0.066 | 0.338 | 0.114 |
| 5.419247327442195 | 0.578 | 0.193 | 0.065 | 0.334 | 0.112 |
| 5.422388920095785 | 0.575 | 0.19 | 0.063 | 0.331 | 0.109 |
| 5.425530512749375 | 0.572 | 0.187 | 0.061 | 0.327 | 0.107 |
| 5.428672105402964 | 0.569 | 0.184 | 0.06 | 0.324 | 0.105 |
| 5.431813698056554 | 0.566 | 0.181 | 0.058 | 0.32 | 0.102 |
| 5.434955290710143 | 0.563 | 0.178 | 0.056 | 0.317 | 0.1 |
| 5.438096883363733 | 0.56 | 0.175 | 0.055 | 0.313 | 0.098 |
| 5.441238476017322 | 0.556 | 0.172 | 0.053 | 0.31 | 0.096 |
| 5.444380068670912 | 0.553 | 0.169 | 0.052 | 0.306 | 0.094 |
| 5.447521661324502 | 0.55 | 0.167 | 0.05 | 0.303 | 0.092 |
| 5.450663253978091 | 0.547 | 0.164 | 0.049 | 0.299 | 0.09 |
| 5.453804846631681 | 0.544 | 0.161 | 0.048 | 0.296 | 0.088 |
| 5.456946439285271 | 0.541 | 0.158 | 0.046 | 0.292 | 0.086 |
| 5.46008803193886 | 0.538 | 0.155 | 0.045 | 0.289 | 0.084 |
| 5.46322962459245 | 0.535 | 0.153 | 0.044 | 0.286 | 0.082 |
| 5.466371217246039 | 0.531 | 0.15 | 0.042 | 0.282 | 0.08 |
| 5.46951280989963 | 0.528 | 0.147 | 0.041 | 0.279 | 0.078 |
| 5.472654402553218 | 0.525 | 0.145 | 0.04 | 0.276 | 0.076 |
| 5.475795995206808 | 0.522 | 0.142 | 0.039 | 0.272 | 0.074 |
| 5.478937587860398 | 0.519 | 0.14 | 0.038 | 0.269 | 0.072 |
| 5.482079180513987 | 0.516 | 0.137 | 0.036 | 0.266 | 0.071 |
| 5.485220773167577 | 0.513 | 0.135 | 0.035 | 0.263 | 0.069 |
| 5.488362365821166 | 0.509 | 0.132 | 0.034 | 0.26 | 0.067 |
| 5.491503958474756 | 0.506 | 0.13 | 0.033 | 0.256 | 0.066 |
| 5.494645551128346 | 0.503 | 0.127 | 0.032 | 0.253 | 0.064 |
| 5.497787143781935 | 0.5 | 0.125 | 0.031 | 0.25 | 0.063 |
| 5.500928736435525 | 0.497 | 0.123 | 0.03 | 0.247 | 0.061 |
| 5.504070329089115 | 0.494 | 0.12 | 0.029 | 0.244 | 0.059 |
| 5.507211921742704 | 0.491 | 0.118 | 0.028 | 0.241 | 0.058 |
| 5.510353514396294 | 0.487 | 0.116 | 0.028 | 0.238 | 0.056 |
| 5.513495107049883 | 0.484 | 0.114 | 0.027 | 0.235 | 0.055 |
| 5.516636699703473 | 0.481 | 0.111 | 0.026 | 0.232 | 0.054 |
| 5.519778292357062 | 0.478 | 0.109 | 0.025 | 0.228 | 0.052 |
| 5.522919885010652 | 0.475 | 0.107 | 0.024 | 0.226 | 0.051 |
| 5.526061477664242 | 0.472 | 0.105 | 0.023 | 0.223 | 0.05 |
| 5.529203070317831 | 0.469 | 0.103 | 0.023 | 0.22 | 0.048 |
| 5.532344662971421 | 0.465 | 0.101 | 0.022 | 0.217 | 0.047 |
| 5.535486255625011 | 0.462 | 0.099 | 0.021 | 0.214 | 0.046 |
| 5.5386278482786 | 0.459 | 0.097 | 0.02 | 0.211 | 0.044 |
| 5.54176944093219 | 0.456 | 0.095 | 0.02 | 0.208 | 0.043 |
| 5.544911033585779 | 0.453 | 0.093 | 0.019 | 0.205 | 0.042 |
| 5.54805262623937 | 0.45 | 0.091 | 0.018 | 0.202 | 0.041 |
| 5.551194218892959 | 0.447 | 0.089 | 0.018 | 0.2 | 0.04 |
| 5.554335811546548 | 0.444 | 0.087 | 0.017 | 0.197 | 0.039 |
| 5.557477404200137 | 0.44 | 0.085 | 0.017 | 0.194 | 0.038 |
| 5.560618996853727 | 0.437 | 0.084 | 0.016 | 0.191 | 0.037 |
| 5.563760589507317 | 0.434 | 0.082 | 0.015 | 0.189 | 0.036 |
| 5.566902182160906 | 0.431 | 0.08 | 0.015 | 0.186 | 0.035 |
| 5.570043774814496 | 0.428 | 0.078 | 0.014 | 0.183 | 0.034 |
| 5.573185367468086 | 0.425 | 0.077 | 0.014 | 0.181 | 0.033 |
| 5.576326960121675 | 0.422 | 0.075 | 0.013 | 0.178 | 0.032 |
| 5.579468552775264 | 0.419 | 0.073 | 0.013 | 0.175 | 0.031 |
| 5.582610145428854 | 0.416 | 0.072 | 0.012 | 0.173 | 0.03 |
| 5.585751738082444 | 0.412 | 0.07 | 0.012 | 0.17 | 0.029 |
| 5.588893330736034 | 0.409 | 0.069 | 0.012 | 0.168 | 0.028 |
| 5.592034923389623 | 0.406 | 0.067 | 0.011 | 0.165 | 0.027 |
| 5.595176516043213 | 0.403 | 0.066 | 0.011 | 0.163 | 0.026 |
| 5.598318108696803 | 0.4 | 0.064 | 0.01 | 0.16 | 0.026 |
| 5.601459701350392 | 0.397 | 0.063 | 0.01 | 0.158 | 0.025 |
| 5.604601294003982 | 0.394 | 0.061 | 0.009 | 0.155 | 0.024 |
| 5.607742886657571 | 0.391 | 0.06 | 0.009 | 0.153 | 0.023 |
| 5.610884479311161 | 0.388 | 0.058 | 0.009 | 0.15 | 0.023 |
| 5.61402607196475 | 0.385 | 0.057 | 0.008 | 0.148 | 0.022 |
| 5.61716766461834 | 0.382 | 0.056 | 0.008 | 0.146 | 0.021 |
| 5.62030925727193 | 0.379 | 0.054 | 0.008 | 0.143 | 0.021 |
| 5.623450849925519 | 0.376 | 0.053 | 0.007 | 0.141 | 0.02 |
| 5.626592442579109 | 0.373 | 0.052 | 0.007 | 0.139 | 0.019 |
| 5.629734035232698 | 0.37 | 0.05 | 0.007 | 0.137 | 0.019 |
| 5.632875627886288 | 0.367 | 0.049 | 0.007 | 0.134 | 0.018 |
| 5.636017220539878 | 0.364 | 0.048 | 0.006 | 0.132 | 0.017 |
| 5.639158813193467 | 0.361 | 0.047 | 0.006 | 0.13 | 0.017 |
| 5.642300405847057 | 0.357 | 0.046 | 0.006 | 0.128 | 0.016 |
| 5.645441998500646 | 0.354 | 0.045 | 0.006 | 0.126 | 0.016 |
| 5.648583591154236 | 0.351 | 0.043 | 0.005 | 0.124 | 0.015 |
| 5.651725183807825 | 0.348 | 0.042 | 0.005 | 0.121 | 0.015 |
| 5.654866776461415 | 0.345 | 0.041 | 0.005 | 0.119 | 0.014 |
| 5.658008369115005 | 0.343 | 0.04 | 0.005 | 0.117 | 0.014 |
| 5.661149961768594 | 0.34 | 0.039 | 0.005 | 0.115 | 0.013 |
| 5.664291554422184 | 0.337 | 0.038 | 0.004 | 0.113 | 0.013 |
| 5.667433147075774 | 0.334 | 0.037 | 0.004 | 0.111 | 0.012 |
| 5.670574739729363 | 0.331 | 0.036 | 0.004 | 0.109 | 0.012 |
| 5.673716332382953 | 0.328 | 0.035 | 0.004 | 0.107 | 0.012 |
| 5.676857925036542 | 0.325 | 0.034 | 0.004 | 0.105 | 0.011 |
| 5.679999517690132 | 0.322 | 0.033 | 0.003 | 0.104 | 0.011 |
| 5.683141110343721 | 0.319 | 0.032 | 0.003 | 0.102 | 0.01 |
| 5.686282702997311 | 0.316 | 0.032 | 0.003 | 0.1 | 0.01 |
| 5.689424295650901 | 0.313 | 0.031 | 0.003 | 0.098 | 0.01 |
| 5.69256588830449 | 0.31 | 0.03 | 0.003 | 0.096 | 0.009 |
| 5.69570748095808 | 0.307 | 0.029 | 0.003 | 0.094 | 0.009 |
| 5.69884907361167 | 0.304 | 0.028 | 0.003 | 0.093 | 0.009 |
| 5.701990666265259 | 0.301 | 0.027 | 0.002 | 0.091 | 0.008 |
| 5.705132258918849 | 0.299 | 0.027 | 0.002 | 0.089 | 0.008 |
| 5.708273851572438 | 0.296 | 0.026 | 0.002 | 0.087 | 0.008 |
| 5.711415444226028 | 0.293 | 0.025 | 0.002 | 0.086 | 0.007 |
| 5.714557036879618 | 0.29 | 0.024 | 0.002 | 0.084 | 0.007 |
| 5.717698629533207 | 0.287 | 0.024 | 0.002 | 0.082 | 0.007 |
| 5.720840222186797 | 0.284 | 0.023 | 0.002 | 0.081 | 0.007 |
| 5.723981814840386 | 0.281 | 0.022 | 0.002 | 0.079 | 0.006 |
| 5.727123407493976 | 0.279 | 0.022 | 0.002 | 0.078 | 0.006 |
| 5.730265000147565 | 0.276 | 0.021 | 0.002 | 0.076 | 0.006 |
| 5.733406592801155 | 0.273 | 0.02 | 0.002 | 0.075 | 0.006 |
| 5.736548185454744 | 0.27 | 0.02 | 0.001 | 0.073 | 0.005 |
| 5.739689778108334 | 0.267 | 0.019 | 0.001 | 0.072 | 0.005 |
| 5.742831370761924 | 0.265 | 0.019 | 0.001 | 0.07 | 0.005 |
| 5.745972963415514 | 0.262 | 0.018 | 0.001 | 0.069 | 0.005 |
| 5.749114556069103 | 0.259 | 0.017 | 0.001 | 0.067 | 0.005 |
| 5.752256148722693 | 0.256 | 0.017 | 0.001 | 0.066 | 0.004 |
| 5.755397741376282 | 0.254 | 0.016 | 0.001 | 0.064 | 0.004 |
| 5.758539334029872 | 0.251 | 0.016 | 0.001 | 0.063 | 0.004 |
| 5.761680926683462 | 0.248 | 0.015 | 0.001 | 0.062 | 0.004 |
| 5.764822519337051 | 0.245 | 0.015 | 0.001 | 0.06 | 0.004 |
| 5.767964111990641 | 0.243 | 0.014 | 0.001 | 0.059 | 0.003 |
| 5.77110570464423 | 0.24 | 0.014 | 0.001 | 0.058 | 0.003 |
| 5.77424729729782 | 0.237 | 0.013 | 0.001 | 0.056 | 0.003 |
| 5.77738888995141 | 0.235 | 0.013 | 0.001 | 0.055 | 0.003 |
| 5.780530482605 | 0.232 | 0.013 | 0.001 | 0.054 | 0.003 |
| 5.783672075258588 | 0.229 | 0.012 | 0.001 | 0.053 | 0.003 |
| 5.786813667912178 | 0.227 | 0.012 | 0.001 | 0.051 | 0.003 |
| 5.789955260565768 | 0.224 | 0.011 | 0.001 | 0.05 | 0.003 |
| 5.793096853219358 | 0.222 | 0.011 | 0.001 | 0.049 | 0.002 |
| 5.796238445872947 | 0.219 | 0.01 | 0.001 | 0.048 | 0.002 |
| 5.799380038526537 | 0.216 | 0.01 | 0 | 0.047 | 0.002 |
| 5.802521631180126 | 0.214 | 0.01 | 0 | 0.046 | 0.002 |
| 5.805663223833715 | 0.211 | 0.009 | 0 | 0.045 | 0.002 |
| 5.808804816487306 | 0.209 | 0.009 | 0 | 0.044 | 0.002 |
| 5.811946409140895 | 0.206 | 0.009 | 0 | 0.042 | 0.002 |
| 5.815088001794485 | 0.204 | 0.008 | 0 | 0.041 | 0.002 |
| 5.818229594448074 | 0.201 | 0.008 | 0 | 0.04 | 0.002 |
| 5.821371187101663 | 0.199 | 0.008 | 0 | 0.039 | 0.002 |
| 5.824512779755254 | 0.196 | 0.008 | 0 | 0.038 | 0.001 |
| 5.827654372408843 | 0.194 | 0.007 | 0 | 0.037 | 0.001 |
| 5.830795965062433 | 0.191 | 0.007 | 0 | 0.037 | 0.001 |
| 5.833937557716022 | 0.189 | 0.007 | 0 | 0.036 | 0.001 |
| 5.837079150369612 | 0.186 | 0.006 | 0 | 0.035 | 0.001 |
| 5.840220743023201 | 0.184 | 0.006 | 0 | 0.034 | 0.001 |
| 5.843362335676791 | 0.181 | 0.006 | 0 | 0.033 | 0.001 |
| 5.846503928330381 | 0.179 | 0.006 | 0 | 0.032 | 0.001 |
| 5.84964552098397 | 0.176 | 0.005 | 0 | 0.031 | 0.001 |
| 5.85278711363756 | 0.174 | 0.005 | 0 | 0.03 | 0.001 |
| 5.85592870629115 | 0.172 | 0.005 | 0 | 0.029 | 0.001 |
| 5.85907029894474 | 0.169 | 0.005 | 0 | 0.029 | 0.001 |
| 5.862211891598329 | 0.167 | 0.005 | 0 | 0.028 | 0.001 |
| 5.865353484251918 | 0.165 | 0.004 | 0 | 0.027 | 0.001 |
| 5.868495076905508 | 0.162 | 0.004 | 0 | 0.026 | 0.001 |
| 5.871636669559098 | 0.16 | 0.004 | 0 | 0.026 | 0.001 |
| 5.874778262212687 | 0.158 | 0.004 | 0 | 0.025 | 0.001 |
| 5.877919854866277 | 0.155 | 0.004 | 0 | 0.024 | 0.001 |
| 5.881061447519866 | 0.153 | 0.004 | 0 | 0.023 | 0.001 |
| 5.884203040173456 | 0.151 | 0.003 | 0 | 0.023 | 0.001 |
| 5.887344632827046 | 0.149 | 0.003 | 0 | 0.022 | 0 |
| 5.890486225480635 | 0.146 | 0.003 | 0 | 0.021 | 0 |
| 5.893627818134224 | 0.144 | 0.003 | 0 | 0.021 | 0 |
| 5.896769410787814 | 0.142 | 0.003 | 0 | 0.02 | 0 |
| 5.899911003441404 | 0.14 | 0.003 | 0 | 0.02 | 0 |
| 5.903052596094994 | 0.138 | 0.003 | 0 | 0.019 | 0 |
| 5.906194188748583 | 0.136 | 0.002 | 0 | 0.018 | 0 |
| 5.909335781402172 | 0.133 | 0.002 | 0 | 0.018 | 0 |
| 5.912477374055762 | 0.131 | 0.002 | 0 | 0.017 | 0 |
| 5.915618966709352 | 0.129 | 0.002 | 0 | 0.017 | 0 |
| 5.918760559362942 | 0.127 | 0.002 | 0 | 0.016 | 0 |
| 5.921902152016531 | 0.125 | 0.002 | 0 | 0.016 | 0 |
| 5.92504374467012 | 0.123 | 0.002 | 0 | 0.015 | 0 |
| 5.92818533732371 | 0.121 | 0.002 | 0 | 0.015 | 0 |
| 5.9313269299773 | 0.119 | 0.002 | 0 | 0.014 | 0 |
| 5.93446852263089 | 0.117 | 0.002 | 0 | 0.014 | 0 |
| 5.93761011528448 | 0.115 | 0.002 | 0 | 0.013 | 0 |
| 5.940751707938068 | 0.113 | 0.001 | 0 | 0.013 | 0 |
| 5.943893300591658 | 0.111 | 0.001 | 0 | 0.012 | 0 |
| 5.947034893245248 | 0.109 | 0.001 | 0 | 0.012 | 0 |
| 5.950176485898837 | 0.107 | 0.001 | 0 | 0.011 | 0 |
| 5.953318078552427 | 0.105 | 0.001 | 0 | 0.011 | 0 |
| 5.956459671206017 | 0.103 | 0.001 | 0 | 0.011 | 0 |
| 5.959601263859606 | 0.101 | 0.001 | 0 | 0.01 | 0 |
| 5.962742856513196 | 0.099 | 0.001 | 0 | 0.01 | 0 |
| 5.965884449166785 | 0.097 | 0.001 | 0 | 0.009 | 0 |
| 5.969026041820375 | 0.095 | 0.001 | 0 | 0.009 | 0 |
| 5.972167634473964 | 0.094 | 0.001 | 0 | 0.009 | 0 |
| 5.975309227127554 | 0.092 | 0.001 | 0 | 0.008 | 0 |
| 5.978450819781144 | 0.09 | 0.001 | 0 | 0.008 | 0 |
| 5.981592412434733 | 0.088 | 0.001 | 0 | 0.008 | 0 |
| 5.984734005088323 | 0.086 | 0.001 | 0 | 0.007 | 0 |
| 5.987875597741913 | 0.085 | 0.001 | 0 | 0.007 | 0 |
| 5.991017190395502 | 0.083 | 0.001 | 0 | 0.007 | 0 |
| 5.994158783049092 | 0.081 | 0.001 | 0 | 0.007 | 0 |
| 5.997300375702681 | 0.08 | 0.001 | 0 | 0.006 | 0 |
| 6.000441968356271 | 0.078 | 0 | 0 | 0.006 | 0 |
| 6.003583561009861 | 0.076 | 0 | 0 | 0.006 | 0 |
| 6.00672515366345 | 0.075 | 0 | 0 | 0.006 | 0 |
| 6.00986674631704 | 0.073 | 0 | 0 | 0.005 | 0 |
| 6.01300833897063 | 0.071 | 0 | 0 | 0.005 | 0 |
| 6.01614993162422 | 0.07 | 0 | 0 | 0.005 | 0 |
| 6.019291524277808 | 0.068 | 0 | 0 | 0.005 | 0 |
| 6.022433116931398 | 0.066 | 0 | 0 | 0.004 | 0 |
| 6.025574709584988 | 0.065 | 0 | 0 | 0.004 | 0 |
| 6.028716302238577 | 0.063 | 0 | 0 | 0.004 | 0 |
| 6.031857894892167 | 0.062 | 0 | 0 | 0.004 | 0 |
| 6.034999487545757 | 0.06 | 0 | 0 | 0.004 | 0 |
| 6.038141080199346 | 0.059 | 0 | 0 | 0.003 | 0 |
| 6.041282672852935 | 0.057 | 0 | 0 | 0.003 | 0 |
| 6.044424265506525 | 0.056 | 0 | 0 | 0.003 | 0 |
| 6.047565858160115 | 0.054 | 0 | 0 | 0.003 | 0 |
| 6.050707450813704 | 0.053 | 0 | 0 | 0.003 | 0 |
| 6.053849043467294 | 0.052 | 0 | 0 | 0.003 | 0 |
| 6.056990636120884 | 0.05 | 0 | 0 | 0.003 | 0 |
| 6.060132228774473 | 0.049 | 0 | 0 | 0.002 | 0 |
| 6.063273821428063 | 0.048 | 0 | 0 | 0.002 | 0 |
| 6.066415414081653 | 0.046 | 0 | 0 | 0.002 | 0 |
| 6.069557006735242 | 0.045 | 0 | 0 | 0.002 | 0 |
| 6.072698599388831 | 0.044 | 0 | 0 | 0.002 | 0 |
| 6.07584019204242 | 0.042 | 0 | 0 | 0.002 | 0 |
| 6.078981784696011 | 0.041 | 0 | 0 | 0.002 | 0 |
| 6.082123377349601 | 0.04 | 0 | 0 | 0.002 | 0 |
| 6.08526497000319 | 0.039 | 0 | 0 | 0.001 | 0 |
| 6.08840656265678 | 0.037 | 0 | 0 | 0.001 | 0 |
| 6.09154815531037 | 0.036 | 0 | 0 | 0.001 | 0 |
| 6.094689747963959 | 0.035 | 0 | 0 | 0.001 | 0 |
| 6.097831340617549 | 0.034 | 0 | 0 | 0.001 | 0 |
| 6.100972933271138 | 0.033 | 0 | 0 | 0.001 | 0 |
| 6.104114525924728 | 0.032 | 0 | 0 | 0.001 | 0 |
| 6.107256118578317 | 0.031 | 0 | 0 | 0.001 | 0 |
| 6.110397711231907 | 0.03 | 0 | 0 | 0.001 | 0 |
| 6.113539303885497 | 0.029 | 0 | 0 | 0.001 | 0 |
| 6.116680896539086 | 0.027 | 0 | 0 | 0.001 | 0 |
| 6.119822489192675 | 0.026 | 0 | 0 | 0.001 | 0 |
| 6.122964081846265 | 0.025 | 0 | 0 | 0.001 | 0 |
| 6.126105674499855 | 0.024 | 0 | 0 | 0.001 | 0 |
| 6.129247267153445 | 0.024 | 0 | 0 | 0.001 | 0 |
| 6.132388859807034 | 0.023 | 0 | 0 | 0.001 | 0 |
| 6.135530452460624 | 0.022 | 0 | 0 | 0 | 0 |
| 6.138672045114213 | 0.021 | 0 | 0 | 0 | 0 |
| 6.141813637767803 | 0.02 | 0 | 0 | 0 | 0 |
| 6.144955230421393 | 0.019 | 0 | 0 | 0 | 0 |
| 6.148096823074982 | 0.018 | 0 | 0 | 0 | 0 |
| 6.151238415728571 | 0.017 | 0 | 0 | 0 | 0 |
| 6.154380008382161 | 0.016 | 0 | 0 | 0 | 0 |
| 6.157521601035751 | 0.016 | 0 | 0 | 0 | 0 |
| 6.16066319368934 | 0.015 | 0 | 0 | 0 | 0 |
| 6.16380478634293 | 0.014 | 0 | 0 | 0 | 0 |
| 6.16694637899652 | 0.013 | 0 | 0 | 0 | 0 |
| 6.170087971650109 | 0.013 | 0 | 0 | 0 | 0 |
| 6.173229564303698 | 0.012 | 0 | 0 | 0 | 0 |
| 6.176371156957289 | 0.011 | 0 | 0 | 0 | 0 |
| 6.179512749610878 | 0.011 | 0 | 0 | 0 | 0 |
| 6.182654342264468 | 0.01 | 0 | 0 | 0 | 0 |
| 6.185795934918057 | 0.009 | 0 | 0 | 0 | 0 |
| 6.188937527571647 | 0.009 | 0 | 0 | 0 | 0 |
| 6.192079120225237 | 0.008 | 0 | 0 | 0 | 0 |
| 6.195220712878826 | 0.008 | 0 | 0 | 0 | 0 |
| 6.198362305532415 | 0.007 | 0 | 0 | 0 | 0 |
| 6.201503898186005 | 0.007 | 0 | 0 | 0 | 0 |
| 6.204645490839594 | 0.006 | 0 | 0 | 0 | 0 |
| 6.207787083493184 | 0.006 | 0 | 0 | 0 | 0 |
| 6.210928676146774 | 0.005 | 0 | 0 | 0 | 0 |
| 6.214070268800364 | 0.005 | 0 | 0 | 0 | 0 |
| 6.217211861453953 | 0.004 | 0 | 0 | 0 | 0 |
| 6.220353454107543 | 0.004 | 0 | 0 | 0 | 0 |
| 6.223495046761133 | 0.004 | 0 | 0 | 0 | 0 |
| 6.226636639414722 | 0.003 | 0 | 0 | 0 | 0 |
| 6.229778232068312 | 0.003 | 0 | 0 | 0 | 0 |
| 6.232919824721901 | 0.003 | 0 | 0 | 0 | 0 |
| 6.236061417375491 | 0.002 | 0 | 0 | 0 | 0 |
| 6.23920301002908 | 0.002 | 0 | 0 | 0 | 0 |
| 6.24234460268267 | 0.002 | 0 | 0 | 0 | 0 |
| 6.24548619533626 | 0.001 | 0 | 0 | 0 | 0 |
| 6.24862778798985 | 0.001 | 0 | 0 | 0 | 0 |
| 6.251769380643438 | 0.001 | 0 | 0 | 0 | 0 |
| 6.254910973297028 | 0.001 | 0 | 0 | 0 | 0 |
| 6.258052565950618 | 0.001 | 0 | 0 | 0 | 0 |
| 6.261194158604208 | 0 | 0 | 0 | 0 | 0 |
| 6.264335751257797 | 0 | 0 | 0 | 0 | 0 |
| 6.267477343911387 | 0 | 0 | 0 | 0 | 0 |
| 6.270618936564976 | 0 | 0 | 0 | 0 | 0 |
| 6.273760529218566 | 0 | 0 | 0 | 0 | 0 |
| 6.276902121872155 | 0 | 0 | 0 | 0 | 0 |
| 6.280043714525745 | 0 | 0 | 0 | 0 | 0 |
| 6.283185307179335 | 0 | 0 | 0 | 0 | 0 |